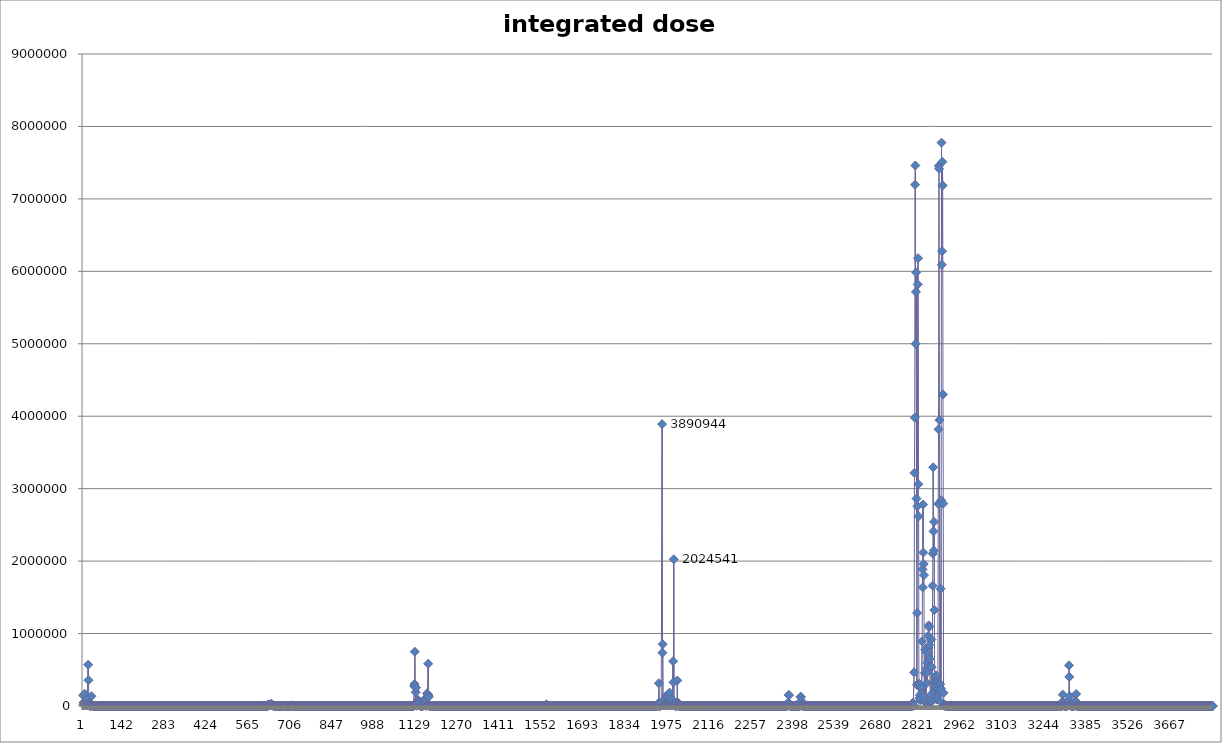
| Category | integrated dose (mGy) |
|---|---|
| 0 | 146913.26 |
| 1 | 47168.431 |
| 2 | 16474.147 |
| 3 | 19973.04 |
| 4 | 52875.603 |
| 5 | 169686.074 |
| 6 | 42847.178 |
| 7 | 30205.269 |
| 8 | 17112.355 |
| 9 | 18833.48 |
| 10 | 17870.895 |
| 11 | 18359.048 |
| 12 | 17347.151 |
| 13 | 97437.491 |
| 14 | 12307.267 |
| 15 | 10980.042 |
| 16 | 15013.119 |
| 17 | 569934.394 |
| 18 | 355591.583 |
| 19 | 43135.492 |
| 20 | 44348.157 |
| 21 | 28792.925 |
| 22 | 1795.39 |
| 23 | 7134.684 |
| 24 | 1881.535 |
| 25 | 2678.828 |
| 26 | 1564.105 |
| 27 | 9494.582 |
| 28 | 135804.302 |
| 29 | 14220.9 |
| 30 | 18117.512 |
| 31 | 2346.066 |
| 32 | 1790.662 |
| 33 | 1537.437 |
| 34 | 3353.156 |
| 35 | 1175.286 |
| 36 | 2075.394 |
| 37 | 353.776 |
| 38 | 478.748 |
| 39 | 322.157 |
| 40 | 958.439 |
| 41 | 440.392 |
| 42 | 363.976 |
| 43 | 236.195 |
| 44 | 506.674 |
| 45 | 155.876 |
| 46 | 200.646 |
| 47 | 127.648 |
| 48 | 260.69 |
| 49 | 205.865 |
| 50 | 234.515 |
| 51 | 308.53 |
| 52 | 208.58 |
| 53 | 221.372 |
| 54 | 239.774 |
| 55 | 133.824 |
| 56 | 539.037 |
| 57 | 145.965 |
| 58 | 263.314 |
| 59 | 143.309 |
| 60 | 238.723 |
| 61 | 327.87 |
| 62 | 4196.176 |
| 63 | 380.298 |
| 64 | 1165.318 |
| 65 | 173.021 |
| 66 | 388.234 |
| 67 | 168.84 |
| 68 | 179.166 |
| 69 | 80.651 |
| 70 | 142.878 |
| 71 | 107.209 |
| 72 | 135.183 |
| 73 | 175.527 |
| 74 | 82.107 |
| 75 | 84.558 |
| 76 | 138.68 |
| 77 | 165.458 |
| 78 | 871.94 |
| 79 | 1189.962 |
| 80 | 1108.671 |
| 81 | 1283.256 |
| 82 | 2549.128 |
| 83 | 1574.25 |
| 84 | 3073.741 |
| 85 | 2634.265 |
| 86 | 471.512 |
| 87 | 983.38 |
| 88 | 534.577 |
| 89 | 222.272 |
| 90 | 406.166 |
| 91 | 101.11 |
| 92 | 133.559 |
| 93 | 104.992 |
| 94 | 139.493 |
| 95 | 112.292 |
| 96 | 115.567 |
| 97 | 110.939 |
| 98 | 160.088 |
| 99 | 121.699 |
| 100 | 223.087 |
| 101 | 123.056 |
| 102 | 136.251 |
| 103 | 143.438 |
| 104 | 109.413 |
| 105 | 75.959 |
| 106 | 115.371 |
| 107 | 112.439 |
| 108 | 100.381 |
| 109 | 150.574 |
| 110 | 124.471 |
| 111 | 120.084 |
| 112 | 145.872 |
| 113 | 138.666 |
| 114 | 118.229 |
| 115 | 59.514 |
| 116 | 140.295 |
| 117 | 118.128 |
| 118 | 101.698 |
| 119 | 112.302 |
| 120 | 103.639 |
| 121 | 102.604 |
| 122 | 88.791 |
| 123 | 112.662 |
| 124 | 117.782 |
| 125 | 160.199 |
| 126 | 100.605 |
| 127 | 89.321 |
| 128 | 160.143 |
| 129 | 159.998 |
| 130 | 145.849 |
| 131 | 143.346 |
| 132 | 76.221 |
| 133 | 105.544 |
| 134 | 107.265 |
| 135 | 103.504 |
| 136 | 82.973 |
| 137 | 90.004 |
| 138 | 129.115 |
| 139 | 133.452 |
| 140 | 92.039 |
| 141 | 130.34 |
| 142 | 89.072 |
| 143 | 96.466 |
| 144 | 98.555 |
| 145 | 134.952 |
| 146 | 125.811 |
| 147 | 113.897 |
| 148 | 137.633 |
| 149 | 95.167 |
| 150 | 139.3 |
| 151 | 62.251 |
| 152 | 155.574 |
| 153 | 141.674 |
| 154 | 134.713 |
| 155 | 67.525 |
| 156 | 132.56 |
| 157 | 142.817 |
| 158 | 81.951 |
| 159 | 85.234 |
| 160 | 127.6 |
| 161 | 148.004 |
| 162 | 165.537 |
| 163 | 168.222 |
| 164 | 137.644 |
| 165 | 93.606 |
| 166 | 128.58 |
| 167 | 77.428 |
| 168 | 143.335 |
| 169 | 149.246 |
| 170 | 65.368 |
| 171 | 138.966 |
| 172 | 106.212 |
| 173 | 128.62 |
| 174 | 95.247 |
| 175 | 111.777 |
| 176 | 79.179 |
| 177 | 149.757 |
| 178 | 129.431 |
| 179 | 116.01 |
| 180 | 113.458 |
| 181 | 91.842 |
| 182 | 54.996 |
| 183 | 106.175 |
| 184 | 102.723 |
| 185 | 123.551 |
| 186 | 132.675 |
| 187 | 115.482 |
| 188 | 118.488 |
| 189 | 156.964 |
| 190 | 90.107 |
| 191 | 104.69 |
| 192 | 89.968 |
| 193 | 106.324 |
| 194 | 120.274 |
| 195 | 77.025 |
| 196 | 163.706 |
| 197 | 88.13 |
| 198 | 86.082 |
| 199 | 174.275 |
| 200 | 112.549 |
| 201 | 160.455 |
| 202 | 104.278 |
| 203 | 127.108 |
| 204 | 130.939 |
| 205 | 90.383 |
| 206 | 85.223 |
| 207 | 133.005 |
| 208 | 136.102 |
| 209 | 105.733 |
| 210 | 132.096 |
| 211 | 141.842 |
| 212 | 157.438 |
| 213 | 125.566 |
| 214 | 157.466 |
| 215 | 115.36 |
| 216 | 137.221 |
| 217 | 132.189 |
| 218 | 90.765 |
| 219 | 89.423 |
| 220 | 71.746 |
| 221 | 171.17 |
| 222 | 82.844 |
| 223 | 140.551 |
| 224 | 74.773 |
| 225 | 72.735 |
| 226 | 137.62 |
| 227 | 136.028 |
| 228 | 152.172 |
| 229 | 133.041 |
| 230 | 135.709 |
| 231 | 151.791 |
| 232 | 124.335 |
| 233 | 121.189 |
| 234 | 157.244 |
| 235 | 117.234 |
| 236 | 146.467 |
| 237 | 117.725 |
| 238 | 113.981 |
| 239 | 175.276 |
| 240 | 109.582 |
| 241 | 142.746 |
| 242 | 104.616 |
| 243 | 102.09 |
| 244 | 156.002 |
| 245 | 95.481 |
| 246 | 163.291 |
| 247 | 90.033 |
| 248 | 175.285 |
| 249 | 129.774 |
| 250 | 87.259 |
| 251 | 128.766 |
| 252 | 167.907 |
| 253 | 151.416 |
| 254 | 192.911 |
| 255 | 94.343 |
| 256 | 125.956 |
| 257 | 52.863 |
| 258 | 52.863 |
| 259 | 114.647 |
| 260 | 114.647 |
| 261 | 99.59 |
| 262 | 99.59 |
| 263 | 131.882 |
| 264 | 131.882 |
| 265 | 155.531 |
| 266 | 155.531 |
| 267 | 111.823 |
| 268 | 111.823 |
| 269 | 139.927 |
| 270 | 139.927 |
| 271 | 57.175 |
| 272 | 57.175 |
| 273 | 127.089 |
| 274 | 127.089 |
| 275 | 107.379 |
| 276 | 107.379 |
| 277 | 139.126 |
| 278 | 139.126 |
| 279 | 127.003 |
| 280 | 127.003 |
| 281 | 136.719 |
| 282 | 136.719 |
| 283 | 112.154 |
| 284 | 112.154 |
| 285 | 122.704 |
| 286 | 122.704 |
| 287 | 140.187 |
| 288 | 140.187 |
| 289 | 120.514 |
| 290 | 120.514 |
| 291 | 151.911 |
| 292 | 151.911 |
| 293 | 122.878 |
| 294 | 122.878 |
| 295 | 121.798 |
| 296 | 121.798 |
| 297 | 114.103 |
| 298 | 114.103 |
| 299 | 121.284 |
| 300 | 121.284 |
| 301 | 244.775 |
| 302 | 244.775 |
| 303 | 132.859 |
| 304 | 132.859 |
| 305 | 99.68 |
| 306 | 99.68 |
| 307 | 84.02 |
| 308 | 84.02 |
| 309 | 129.348 |
| 310 | 129.348 |
| 311 | 87.442 |
| 312 | 87.442 |
| 313 | 114.822 |
| 314 | 114.822 |
| 315 | 129.076 |
| 316 | 129.076 |
| 317 | 164.845 |
| 318 | 164.845 |
| 319 | 95.185 |
| 320 | 95.185 |
| 321 | 142 |
| 322 | 142 |
| 323 | 131.051 |
| 324 | 131.051 |
| 325 | 129.196 |
| 326 | 129.196 |
| 327 | 100.175 |
| 328 | 100.175 |
| 329 | 104.688 |
| 330 | 104.688 |
| 331 | 124.876 |
| 332 | 124.876 |
| 333 | 172.5 |
| 334 | 172.5 |
| 335 | 143.945 |
| 336 | 143.945 |
| 337 | 124.607 |
| 338 | 124.607 |
| 339 | 198.001 |
| 340 | 198.001 |
| 341 | 57.319 |
| 342 | 57.319 |
| 343 | 133.638 |
| 344 | 133.638 |
| 345 | 91.382 |
| 346 | 91.382 |
| 347 | 67.83 |
| 348 | 67.83 |
| 349 | 109.701 |
| 350 | 109.701 |
| 351 | 103.685 |
| 352 | 103.685 |
| 353 | 107.795 |
| 354 | 107.795 |
| 355 | 132.546 |
| 356 | 132.546 |
| 357 | 154.169 |
| 358 | 154.169 |
| 359 | 112.531 |
| 360 | 112.531 |
| 361 | 144.787 |
| 362 | 144.787 |
| 363 | 130.629 |
| 364 | 130.629 |
| 365 | 175.527 |
| 366 | 175.527 |
| 367 | 112.61 |
| 368 | 112.61 |
| 369 | 95.119 |
| 370 | 95.119 |
| 371 | 104.549 |
| 372 | 104.549 |
| 373 | 151.939 |
| 374 | 151.939 |
| 375 | 129.534 |
| 376 | 129.534 |
| 377 | 102.852 |
| 378 | 102.852 |
| 379 | 141.651 |
| 380 | 141.651 |
| 381 | 161.795 |
| 382 | 161.795 |
| 383 | 121.04 |
| 384 | 121.04 |
| 385 | 108.858 |
| 386 | 108.858 |
| 387 | 93.509 |
| 388 | 93.509 |
| 389 | 107.132 |
| 390 | 107.132 |
| 391 | 59.597 |
| 392 | 59.597 |
| 393 | 114.63 |
| 394 | 114.63 |
| 395 | 110.449 |
| 396 | 110.449 |
| 397 | 164.253 |
| 398 | 164.253 |
| 399 | 165.895 |
| 400 | 165.895 |
| 401 | 100.608 |
| 402 | 100.608 |
| 403 | 99.324 |
| 404 | 99.324 |
| 405 | 53.515 |
| 406 | 53.515 |
| 407 | 126.718 |
| 408 | 126.718 |
| 409 | 49.027 |
| 410 | 49.027 |
| 411 | 177.093 |
| 412 | 177.093 |
| 413 | 69.035 |
| 414 | 69.035 |
| 415 | 28.201 |
| 416 | 28.201 |
| 417 | 87.403 |
| 418 | 87.403 |
| 419 | 163.946 |
| 420 | 163.946 |
| 421 | 140.605 |
| 422 | 140.605 |
| 423 | 160.068 |
| 424 | 160.068 |
| 425 | 130.483 |
| 426 | 130.483 |
| 427 | 87.697 |
| 428 | 87.697 |
| 429 | 108.58 |
| 430 | 108.58 |
| 431 | 148.762 |
| 432 | 148.762 |
| 433 | 92.138 |
| 434 | 92.138 |
| 435 | 106.932 |
| 436 | 106.932 |
| 437 | 116.862 |
| 438 | 116.862 |
| 439 | 68.445 |
| 440 | 68.445 |
| 441 | 221.434 |
| 442 | 221.434 |
| 443 | 112.599 |
| 444 | 112.599 |
| 445 | 115.414 |
| 446 | 115.414 |
| 447 | 118.215 |
| 448 | 118.215 |
| 449 | 86.873 |
| 450 | 86.873 |
| 451 | 122.942 |
| 452 | 122.942 |
| 453 | 126.66 |
| 454 | 126.66 |
| 455 | 137.809 |
| 456 | 137.809 |
| 457 | 91.777 |
| 458 | 91.777 |
| 459 | 120.483 |
| 460 | 120.483 |
| 461 | 122.098 |
| 462 | 122.098 |
| 463 | 102.294 |
| 464 | 102.294 |
| 465 | 192.735 |
| 466 | 192.735 |
| 467 | 97.869 |
| 468 | 97.869 |
| 469 | 76.913 |
| 470 | 76.913 |
| 471 | 57.235 |
| 472 | 57.235 |
| 473 | 96.167 |
| 474 | 96.167 |
| 475 | 109.267 |
| 476 | 109.267 |
| 477 | 100.14 |
| 478 | 100.14 |
| 479 | 99.529 |
| 480 | 99.529 |
| 481 | 76.238 |
| 482 | 76.238 |
| 483 | 135.529 |
| 484 | 135.529 |
| 485 | 136.764 |
| 486 | 136.764 |
| 487 | 148.337 |
| 488 | 148.337 |
| 489 | 100.984 |
| 490 | 100.984 |
| 491 | 139.487 |
| 492 | 139.487 |
| 493 | 174.677 |
| 494 | 174.677 |
| 495 | 128.858 |
| 496 | 128.858 |
| 497 | 127.442 |
| 498 | 127.442 |
| 499 | 149.845 |
| 500 | 149.845 |
| 501 | 107.965 |
| 502 | 107.965 |
| 503 | 118.1 |
| 504 | 118.1 |
| 505 | 132.453 |
| 506 | 132.453 |
| 507 | 110.125 |
| 508 | 110.125 |
| 509 | 144.225 |
| 510 | 144.225 |
| 511 | 148.697 |
| 512 | 148.697 |
| 513 | 99.539 |
| 514 | 99.539 |
| 515 | 118.861 |
| 516 | 118.861 |
| 517 | 132.646 |
| 518 | 132.646 |
| 519 | 75.54 |
| 520 | 75.54 |
| 521 | 182.233 |
| 522 | 182.233 |
| 523 | 173.716 |
| 524 | 173.716 |
| 525 | 176.606 |
| 526 | 176.606 |
| 527 | 153.611 |
| 528 | 153.611 |
| 529 | 133.653 |
| 530 | 133.653 |
| 531 | 121.629 |
| 532 | 121.629 |
| 533 | 196.184 |
| 534 | 196.184 |
| 535 | 87.562 |
| 536 | 87.562 |
| 537 | 123.394 |
| 538 | 123.394 |
| 539 | 367.55 |
| 540 | 367.55 |
| 541 | 171.26 |
| 542 | 171.26 |
| 543 | 448.524 |
| 544 | 448.524 |
| 545 | 577.852 |
| 546 | 577.852 |
| 547 | 133.31 |
| 548 | 133.31 |
| 549 | 118.593 |
| 550 | 118.593 |
| 551 | 133.568 |
| 552 | 133.568 |
| 553 | 117.802 |
| 554 | 117.802 |
| 555 | 129.78 |
| 556 | 129.78 |
| 557 | 132.092 |
| 558 | 132.092 |
| 559 | 175.65 |
| 560 | 175.65 |
| 561 | 208.022 |
| 562 | 208.022 |
| 563 | 248.206 |
| 564 | 248.206 |
| 565 | 309.019 |
| 566 | 309.019 |
| 567 | 393.371 |
| 568 | 393.371 |
| 569 | 368.372 |
| 570 | 368.372 |
| 571 | 248.485 |
| 572 | 248.485 |
| 573 | 286.806 |
| 574 | 286.806 |
| 575 | 221.188 |
| 576 | 221.188 |
| 577 | 411.468 |
| 578 | 411.468 |
| 579 | 469.027 |
| 580 | 469.027 |
| 581 | 273.05 |
| 582 | 273.05 |
| 583 | 7670.433 |
| 584 | 7670.433 |
| 585 | 173.408 |
| 586 | 173.408 |
| 587 | 211.375 |
| 588 | 211.375 |
| 589 | 147.084 |
| 590 | 147.084 |
| 591 | 238.251 |
| 592 | 238.251 |
| 593 | 355.901 |
| 594 | 355.901 |
| 595 | 2580.383 |
| 596 | 2580.383 |
| 597 | 181.208 |
| 598 | 181.208 |
| 599 | 394.346 |
| 600 | 394.346 |
| 601 | 222.172 |
| 602 | 222.172 |
| 603 | 811.136 |
| 604 | 811.136 |
| 605 | 651.995 |
| 606 | 651.995 |
| 607 | 884.732 |
| 608 | 884.732 |
| 609 | 1206.5 |
| 610 | 1206.5 |
| 611 | 2763.998 |
| 612 | 2763.998 |
| 613 | 269.223 |
| 614 | 269.223 |
| 615 | 1053.465 |
| 616 | 1053.465 |
| 617 | 316.16 |
| 618 | 316.16 |
| 619 | 2846.88 |
| 620 | 2846.88 |
| 621 | 334.064 |
| 622 | 334.064 |
| 623 | 21355.488 |
| 624 | 21355.488 |
| 625 | 8970.66 |
| 626 | 8970.66 |
| 627 | 12553.194 |
| 628 | 12553.194 |
| 629 | 13147.029 |
| 630 | 13147.029 |
| 631 | 17308.216 |
| 632 | 17308.216 |
| 633 | 29379.257 |
| 634 | 29379.257 |
| 635 | 8188.929 |
| 636 | 8188.929 |
| 637 | 9082.197 |
| 638 | 9082.197 |
| 639 | 3253.518 |
| 640 | 3253.518 |
| 641 | 3323.17 |
| 642 | 3323.17 |
| 643 | 3783.786 |
| 644 | 3783.786 |
| 645 | 659.03 |
| 646 | 659.03 |
| 647 | 528.362 |
| 648 | 528.362 |
| 649 | 580.874 |
| 650 | 580.874 |
| 651 | 1893.122 |
| 652 | 1893.122 |
| 653 | 829.578 |
| 654 | 829.578 |
| 655 | 493.113 |
| 656 | 493.113 |
| 657 | 312.972 |
| 658 | 312.972 |
| 659 | 366.951 |
| 660 | 366.951 |
| 661 | 299.892 |
| 662 | 299.892 |
| 663 | 356.974 |
| 664 | 356.974 |
| 665 | 659.576 |
| 666 | 659.576 |
| 667 | 925.612 |
| 668 | 925.612 |
| 669 | 209.99 |
| 670 | 209.99 |
| 671 | 185.138 |
| 672 | 185.138 |
| 673 | 392.944 |
| 674 | 392.944 |
| 675 | 592.74 |
| 676 | 592.74 |
| 677 | 5692.542 |
| 678 | 5692.542 |
| 679 | 6641.785 |
| 680 | 6641.785 |
| 681 | 960.807 |
| 682 | 785.2 |
| 683 | 241.856 |
| 684 | 170.46 |
| 685 | 244.863 |
| 686 | 323.096 |
| 687 | 155.903 |
| 688 | 192.701 |
| 689 | 156.079 |
| 690 | 123.614 |
| 691 | 85.94 |
| 692 | 180.753 |
| 693 | 186.166 |
| 694 | 139.016 |
| 695 | 192.764 |
| 696 | 185.989 |
| 697 | 328.664 |
| 698 | 387.891 |
| 699 | 396.286 |
| 700 | 1477.383 |
| 701 | 3372.266 |
| 702 | 5618.839 |
| 703 | 9304.747 |
| 704 | 4284.831 |
| 705 | 4295.735 |
| 706 | 374.539 |
| 707 | 147.254 |
| 708 | 410.029 |
| 709 | 215.386 |
| 710 | 51.257 |
| 711 | 187.255 |
| 712 | 283.104 |
| 713 | 248.829 |
| 714 | 407.657 |
| 715 | 215.875 |
| 716 | 93.735 |
| 717 | 173.219 |
| 718 | 175.961 |
| 719 | 611.004 |
| 720 | 414.367 |
| 721 | 244.114 |
| 722 | 157.942 |
| 723 | 150.316 |
| 724 | 165.908 |
| 725 | 149.653 |
| 726 | 140.94 |
| 727 | 200.015 |
| 728 | 103.598 |
| 729 | 95.875 |
| 730 | 157.697 |
| 731 | 86.475 |
| 732 | 115.584 |
| 733 | 118.687 |
| 734 | 109.99 |
| 735 | 131.633 |
| 736 | 113.12 |
| 737 | 138.151 |
| 738 | 145.849 |
| 739 | 148.109 |
| 740 | 108.891 |
| 741 | 171.357 |
| 742 | 92.545 |
| 743 | 162.732 |
| 744 | 133.366 |
| 745 | 233.85 |
| 746 | 116.682 |
| 747 | 194.259 |
| 748 | 115.711 |
| 749 | 198.945 |
| 750 | 134.244 |
| 751 | 66.543 |
| 752 | 212.775 |
| 753 | 80.094 |
| 754 | 167.717 |
| 755 | 182.815 |
| 756 | 126.836 |
| 757 | 334.071 |
| 758 | 170.879 |
| 759 | 435.362 |
| 760 | 170.843 |
| 761 | 236.541 |
| 762 | 111.386 |
| 763 | 138.027 |
| 764 | 151.352 |
| 765 | 172.913 |
| 766 | 108.277 |
| 767 | 80.111 |
| 768 | 148.894 |
| 769 | 82.98 |
| 770 | 99.458 |
| 771 | 67.384 |
| 772 | 113.762 |
| 773 | 128.97 |
| 774 | 78.021 |
| 775 | 122.534 |
| 776 | 127.726 |
| 777 | 120.557 |
| 778 | 130.123 |
| 779 | 128.979 |
| 780 | 94.538 |
| 781 | 106.689 |
| 782 | 134.813 |
| 783 | 125.197 |
| 784 | 174.249 |
| 785 | 115.191 |
| 786 | 187.453 |
| 787 | 111.159 |
| 788 | 118.173 |
| 789 | 174.789 |
| 790 | 139.078 |
| 791 | 154.366 |
| 792 | 95.241 |
| 793 | 164.61 |
| 794 | 106.926 |
| 795 | 124.063 |
| 796 | 139.862 |
| 797 | 142.941 |
| 798 | 136.412 |
| 799 | 144.394 |
| 800 | 128.433 |
| 801 | 88.06 |
| 802 | 159.92 |
| 803 | 95.139 |
| 804 | 158.361 |
| 805 | 167.391 |
| 806 | 98.076 |
| 807 | 130.153 |
| 808 | 102.356 |
| 809 | 140.94 |
| 810 | 130.478 |
| 811 | 96.229 |
| 812 | 101.735 |
| 813 | 83.104 |
| 814 | 86.326 |
| 815 | 95.482 |
| 816 | 145.422 |
| 817 | 177.698 |
| 818 | 104.023 |
| 819 | 118.6 |
| 820 | 101.9 |
| 821 | 128.696 |
| 822 | 141.852 |
| 823 | 148.949 |
| 824 | 123.203 |
| 825 | 149.146 |
| 826 | 154.103 |
| 827 | 120.459 |
| 828 | 124.825 |
| 829 | 91.453 |
| 830 | 95.87 |
| 831 | 91.963 |
| 832 | 152.223 |
| 833 | 158.274 |
| 834 | 139.196 |
| 835 | 124.013 |
| 836 | 98.93 |
| 837 | 144.31 |
| 838 | 115.875 |
| 839 | 132.963 |
| 840 | 95.072 |
| 841 | 100.681 |
| 842 | 81.425 |
| 843 | 114.61 |
| 844 | 107.89 |
| 845 | 122.033 |
| 846 | 112.484 |
| 847 | 121.262 |
| 848 | 113.16 |
| 849 | 135.002 |
| 850 | 172.824 |
| 851 | 132.969 |
| 852 | 130.674 |
| 853 | 129.342 |
| 854 | 126.771 |
| 855 | 161.887 |
| 856 | 117.448 |
| 857 | 141.853 |
| 858 | 165.205 |
| 859 | 142.853 |
| 860 | 141.58 |
| 861 | 118.91 |
| 862 | 157.513 |
| 863 | 126.713 |
| 864 | 106.211 |
| 865 | 101.074 |
| 866 | 158.045 |
| 867 | 137.009 |
| 868 | 123.5 |
| 869 | 76.506 |
| 870 | 301.693 |
| 871 | 160.939 |
| 872 | 119.379 |
| 873 | 104.774 |
| 874 | 152.183 |
| 875 | 144.989 |
| 876 | 135.295 |
| 877 | 100.387 |
| 878 | 134.824 |
| 879 | 128.47 |
| 880 | 136.071 |
| 881 | 172.284 |
| 882 | 123.234 |
| 883 | 140.133 |
| 884 | 135.569 |
| 885 | 96.573 |
| 886 | 139.878 |
| 887 | 77.558 |
| 888 | 98.772 |
| 889 | 95.033 |
| 890 | 97.842 |
| 891 | 56.038 |
| 892 | 160.536 |
| 893 | 95.419 |
| 894 | 129.396 |
| 895 | 132.822 |
| 896 | 94.46 |
| 897 | 86.682 |
| 898 | 78.409 |
| 899 | 98.785 |
| 900 | 104.562 |
| 901 | 84.302 |
| 902 | 70.445 |
| 903 | 145.012 |
| 904 | 156.999 |
| 905 | 84.208 |
| 906 | 138.672 |
| 907 | 122.244 |
| 908 | 128.821 |
| 909 | 100.465 |
| 910 | 96.529 |
| 911 | 144.006 |
| 912 | 105.17 |
| 913 | 110.92 |
| 914 | 115.135 |
| 915 | 128.682 |
| 916 | 167.56 |
| 917 | 114.34 |
| 918 | 120.67 |
| 919 | 87.745 |
| 920 | 116.956 |
| 921 | 132.193 |
| 922 | 117.173 |
| 923 | 132.156 |
| 924 | 150.621 |
| 925 | 135.367 |
| 926 | 124.275 |
| 927 | 106.707 |
| 928 | 117.92 |
| 929 | 141.327 |
| 930 | 138.729 |
| 931 | 143.271 |
| 932 | 167.777 |
| 933 | 188.91 |
| 934 | 210.838 |
| 935 | 139.221 |
| 936 | 223.198 |
| 937 | 156.444 |
| 938 | 224.838 |
| 939 | 110.899 |
| 940 | 126.401 |
| 941 | 139.501 |
| 942 | 131.121 |
| 943 | 121.871 |
| 944 | 123.371 |
| 945 | 117.4 |
| 946 | 131.087 |
| 947 | 111.512 |
| 948 | 111.278 |
| 949 | 80.958 |
| 950 | 97.892 |
| 951 | 121.713 |
| 952 | 124.603 |
| 953 | 117.703 |
| 954 | 139.794 |
| 955 | 122.24 |
| 956 | 113.271 |
| 957 | 104.857 |
| 958 | 114.105 |
| 959 | 87.165 |
| 960 | 131.142 |
| 961 | 125.473 |
| 962 | 117.607 |
| 963 | 121.173 |
| 964 | 130.07 |
| 965 | 101.768 |
| 966 | 132.521 |
| 967 | 107.181 |
| 968 | 133.847 |
| 969 | 112.912 |
| 970 | 97.152 |
| 971 | 93.145 |
| 972 | 119.317 |
| 973 | 110.387 |
| 974 | 113.315 |
| 975 | 126.659 |
| 976 | 123.162 |
| 977 | 110.774 |
| 978 | 153.369 |
| 979 | 137.216 |
| 980 | 107.75 |
| 981 | 102.121 |
| 982 | 124.451 |
| 983 | 127.14 |
| 984 | 72.362 |
| 985 | 122.991 |
| 986 | 97.978 |
| 987 | 132.181 |
| 988 | 162.04 |
| 989 | 119.284 |
| 990 | 115.263 |
| 991 | 136.825 |
| 992 | 118.803 |
| 993 | 59.328 |
| 994 | 124.067 |
| 995 | 135.671 |
| 996 | 124.963 |
| 997 | 136.18 |
| 998 | 127.08 |
| 999 | 119.643 |
| 1000 | 150.819 |
| 1001 | 108.17 |
| 1002 | 100.937 |
| 1003 | 171.267 |
| 1004 | 110.913 |
| 1005 | 124.62 |
| 1006 | 158.7 |
| 1007 | 131.173 |
| 1008 | 123.576 |
| 1009 | 128.784 |
| 1010 | 128.476 |
| 1011 | 104.589 |
| 1012 | 135.365 |
| 1013 | 109.493 |
| 1014 | 146.782 |
| 1015 | 154.521 |
| 1016 | 120.056 |
| 1017 | 120.504 |
| 1018 | 132.058 |
| 1019 | 119.391 |
| 1020 | 158.143 |
| 1021 | 123.529 |
| 1022 | 129.819 |
| 1023 | 116.026 |
| 1024 | 114.008 |
| 1025 | 126.484 |
| 1026 | 106.419 |
| 1027 | 145.797 |
| 1028 | 115.321 |
| 1029 | 120.224 |
| 1030 | 102.556 |
| 1031 | 88.501 |
| 1032 | 135.853 |
| 1033 | 129.091 |
| 1034 | 132.477 |
| 1035 | 102.616 |
| 1036 | 119.87 |
| 1037 | 104.639 |
| 1038 | 106.978 |
| 1039 | 101.175 |
| 1040 | 92.765 |
| 1041 | 216.622 |
| 1042 | 212.696 |
| 1043 | 213.484 |
| 1044 | 174.972 |
| 1045 | 92.785 |
| 1046 | 115.939 |
| 1047 | 111.619 |
| 1048 | 111.755 |
| 1049 | 118.545 |
| 1050 | 100.151 |
| 1051 | 113.915 |
| 1052 | 130.313 |
| 1053 | 104.584 |
| 1054 | 118.065 |
| 1055 | 106.696 |
| 1056 | 120.901 |
| 1057 | 133.902 |
| 1058 | 220.831 |
| 1059 | 209.089 |
| 1060 | 170.257 |
| 1061 | 199.423 |
| 1062 | 177.023 |
| 1063 | 169.415 |
| 1064 | 190.902 |
| 1065 | 90.827 |
| 1066 | 88.963 |
| 1067 | 96.325 |
| 1068 | 74.769 |
| 1069 | 94.997 |
| 1070 | 149.951 |
| 1071 | 182.342 |
| 1072 | 175.695 |
| 1073 | 163.135 |
| 1074 | 220.447 |
| 1075 | 86.061 |
| 1076 | 90.359 |
| 1077 | 104.051 |
| 1078 | 132.527 |
| 1079 | 77.389 |
| 1080 | 199.289 |
| 1081 | 105.696 |
| 1082 | 145.722 |
| 1083 | 124.452 |
| 1084 | 99.981 |
| 1085 | 103.902 |
| 1086 | 127.662 |
| 1087 | 208.08 |
| 1088 | 128.848 |
| 1089 | 143.116 |
| 1090 | 159.505 |
| 1091 | 108.752 |
| 1092 | 124.057 |
| 1093 | 112.528 |
| 1094 | 135.253 |
| 1095 | 105.749 |
| 1096 | 113.738 |
| 1097 | 134.109 |
| 1098 | 152.024 |
| 1099 | 132.69 |
| 1100 | 224.187 |
| 1101 | 134.801 |
| 1102 | 412.138 |
| 1103 | 167.061 |
| 1104 | 1158.126 |
| 1105 | 1231.463 |
| 1106 | 3594.654 |
| 1107 | 222.713 |
| 1108 | 1053.892 |
| 1109 | 362.316 |
| 1110 | 449.16 |
| 1111 | 651.466 |
| 1112 | 956.448 |
| 1113 | 5385.564 |
| 1114 | 272921.163 |
| 1115 | 303084.042 |
| 1116 | 748900.411 |
| 1117 | 13333.627 |
| 1118 | 12987.496 |
| 1119 | 190024.149 |
| 1120 | 253486.825 |
| 1121 | 11973.955 |
| 1122 | 8915.734 |
| 1123 | 4826.461 |
| 1124 | 5369.556 |
| 1125 | 52816.591 |
| 1126 | 42907.696 |
| 1127 | 84542.557 |
| 1128 | 62972.924 |
| 1129 | 60958.905 |
| 1130 | 40607.783 |
| 1131 | 14664.128 |
| 1132 | 48360.89 |
| 1133 | 41092.992 |
| 1134 | 1784.757 |
| 1135 | 1821.149 |
| 1136 | 1137.861 |
| 1137 | 1365.443 |
| 1138 | 1200.288 |
| 1139 | 1065.293 |
| 1140 | 1190.809 |
| 1141 | 925.338 |
| 1142 | 1560.999 |
| 1143 | 1216.061 |
| 1144 | 38483.176 |
| 1145 | 59144.045 |
| 1146 | 10360.63 |
| 1147 | 47081.074 |
| 1148 | 65161.311 |
| 1149 | 73397.307 |
| 1150 | 96812.743 |
| 1151 | 38028.913 |
| 1152 | 33466.494 |
| 1153 | 3124.969 |
| 1154 | 3197.139 |
| 1155 | 5655.775 |
| 1156 | 6219.95 |
| 1157 | 175200.623 |
| 1158 | 128264.111 |
| 1159 | 7957.315 |
| 1160 | 6991.024 |
| 1161 | 583222.754 |
| 1162 | 151235.275 |
| 1163 | 126101.82 |
| 1164 | 4647.866 |
| 1165 | 1556.543 |
| 1166 | 489.59 |
| 1167 | 374.627 |
| 1168 | 351.291 |
| 1169 | 1083.386 |
| 1170 | 275.169 |
| 1171 | 5637.06 |
| 1172 | 1608.38 |
| 1173 | 757.152 |
| 1174 | 169.71 |
| 1175 | 203.032 |
| 1176 | 103.608 |
| 1177 | 197.454 |
| 1178 | 171.631 |
| 1179 | 205.903 |
| 1180 | 119.661 |
| 1181 | 149.508 |
| 1182 | 185.22 |
| 1183 | 211.29 |
| 1184 | 139.451 |
| 1185 | 846.04 |
| 1186 | 124.456 |
| 1187 | 495.306 |
| 1188 | 201.837 |
| 1189 | 550.297 |
| 1190 | 457.601 |
| 1191 | 180.014 |
| 1192 | 148.534 |
| 1193 | 172.366 |
| 1194 | 127.932 |
| 1195 | 169.598 |
| 1196 | 162.826 |
| 1197 | 275.163 |
| 1198 | 55.913 |
| 1199 | 281.558 |
| 1200 | 40.478 |
| 1201 | 127.897 |
| 1202 | 80.872 |
| 1203 | 251.138 |
| 1204 | 222.185 |
| 1205 | 170.517 |
| 1206 | 216.539 |
| 1207 | 201.365 |
| 1208 | 125.921 |
| 1209 | 123.363 |
| 1210 | 90.585 |
| 1211 | 169.059 |
| 1212 | 107.474 |
| 1213 | 332.122 |
| 1214 | 219.817 |
| 1215 | 231.62 |
| 1216 | 283.054 |
| 1217 | 205.963 |
| 1218 | 234.258 |
| 1219 | 157.878 |
| 1220 | 50.445 |
| 1221 | 167.824 |
| 1222 | 12.017 |
| 1223 | 85.909 |
| 1224 | 69.736 |
| 1225 | 81.323 |
| 1226 | 53.06 |
| 1227 | 111.556 |
| 1228 | 114.526 |
| 1229 | 100.817 |
| 1230 | 105.038 |
| 1231 | 110.225 |
| 1232 | 109.445 |
| 1233 | 218.139 |
| 1234 | 196.317 |
| 1235 | 237.238 |
| 1236 | 230.547 |
| 1237 | 115.048 |
| 1238 | 224.034 |
| 1239 | 117.86 |
| 1240 | 123.384 |
| 1241 | 106.635 |
| 1242 | 113.218 |
| 1243 | 131.793 |
| 1244 | 130.326 |
| 1245 | 127.41 |
| 1246 | 114.568 |
| 1247 | 136.961 |
| 1248 | 128.367 |
| 1249 | 126.586 |
| 1250 | 114.356 |
| 1251 | 126.374 |
| 1252 | 129.968 |
| 1253 | 133.133 |
| 1254 | 124.025 |
| 1255 | 135.35 |
| 1256 | 138.94 |
| 1257 | 134.892 |
| 1258 | 133.465 |
| 1259 | 138.274 |
| 1260 | 143.127 |
| 1261 | 125.382 |
| 1262 | 136.604 |
| 1263 | 148.713 |
| 1264 | 129.741 |
| 1265 | 112.969 |
| 1266 | 133.048 |
| 1267 | 116.8 |
| 1268 | 129.616 |
| 1269 | 126.087 |
| 1270 | 103.976 |
| 1271 | 119.163 |
| 1272 | 133.795 |
| 1273 | 113.696 |
| 1274 | 120.246 |
| 1275 | 129.104 |
| 1276 | 113.951 |
| 1277 | 112.523 |
| 1278 | 121.047 |
| 1279 | 117.899 |
| 1280 | 113.959 |
| 1281 | 123.112 |
| 1282 | 109.76 |
| 1283 | 127.824 |
| 1284 | 128.686 |
| 1285 | 126.578 |
| 1286 | 126.963 |
| 1287 | 130.89 |
| 1288 | 127.568 |
| 1289 | 124.592 |
| 1290 | 126.354 |
| 1291 | 114.301 |
| 1292 | 135.302 |
| 1293 | 125.035 |
| 1294 | 123.919 |
| 1295 | 121.695 |
| 1296 | 147.611 |
| 1297 | 122.455 |
| 1298 | 144.543 |
| 1299 | 128.199 |
| 1300 | 131.956 |
| 1301 | 124.456 |
| 1302 | 128.618 |
| 1303 | 150.893 |
| 1304 | 122.075 |
| 1305 | 119.412 |
| 1306 | 122.15 |
| 1307 | 118.377 |
| 1308 | 125.975 |
| 1309 | 125.563 |
| 1310 | 121.862 |
| 1311 | 127.057 |
| 1312 | 125.96 |
| 1313 | 116.232 |
| 1314 | 125.26 |
| 1315 | 131.731 |
| 1316 | 124.807 |
| 1317 | 124.373 |
| 1318 | 117.973 |
| 1319 | 121.885 |
| 1320 | 126.926 |
| 1321 | 130.413 |
| 1322 | 119.121 |
| 1323 | 121.864 |
| 1324 | 134.351 |
| 1325 | 127.809 |
| 1326 | 127.775 |
| 1327 | 126.894 |
| 1328 | 129.132 |
| 1329 | 128.658 |
| 1330 | 128.095 |
| 1331 | 129.805 |
| 1332 | 124.196 |
| 1333 | 122.534 |
| 1334 | 112.844 |
| 1335 | 122.374 |
| 1336 | 129.858 |
| 1337 | 125.436 |
| 1338 | 131.279 |
| 1339 | 127.228 |
| 1340 | 129.743 |
| 1341 | 126.449 |
| 1342 | 125.167 |
| 1343 | 126.265 |
| 1344 | 129.874 |
| 1345 | 122.636 |
| 1346 | 124.945 |
| 1347 | 123.17 |
| 1348 | 125.092 |
| 1349 | 122.214 |
| 1350 | 126.471 |
| 1351 | 115.988 |
| 1352 | 122.459 |
| 1353 | 128.115 |
| 1354 | 121.024 |
| 1355 | 131.394 |
| 1356 | 127.559 |
| 1357 | 122.445 |
| 1358 | 124.434 |
| 1359 | 132.023 |
| 1360 | 126.418 |
| 1361 | 120.225 |
| 1362 | 132.018 |
| 1363 | 134.254 |
| 1364 | 127.628 |
| 1365 | 119.923 |
| 1366 | 125.636 |
| 1367 | 126.502 |
| 1368 | 128.451 |
| 1369 | 125.967 |
| 1370 | 122.007 |
| 1371 | 126.381 |
| 1372 | 131.988 |
| 1373 | 111.688 |
| 1374 | 105.475 |
| 1375 | 120.077 |
| 1376 | 103.604 |
| 1377 | 117.111 |
| 1378 | 111.522 |
| 1379 | 106.966 |
| 1380 | 108.703 |
| 1381 | 114.525 |
| 1382 | 101.092 |
| 1383 | 107.385 |
| 1384 | 109.375 |
| 1385 | 116.037 |
| 1386 | 120.157 |
| 1387 | 122.089 |
| 1388 | 112.882 |
| 1389 | 110.44 |
| 1390 | 113.465 |
| 1391 | 116.809 |
| 1392 | 131.925 |
| 1393 | 115.207 |
| 1394 | 118.781 |
| 1395 | 110.756 |
| 1396 | 112.915 |
| 1397 | 107.942 |
| 1398 | 116.481 |
| 1399 | 113.921 |
| 1400 | 109.008 |
| 1401 | 117.266 |
| 1402 | 112.249 |
| 1403 | 105.833 |
| 1404 | 111.635 |
| 1405 | 119.446 |
| 1406 | 111.3 |
| 1407 | 115.238 |
| 1408 | 110.707 |
| 1409 | 101.841 |
| 1410 | 114.287 |
| 1411 | 130.271 |
| 1412 | 97.254 |
| 1413 | 115.443 |
| 1414 | 116.53 |
| 1415 | 102.996 |
| 1416 | 118.958 |
| 1417 | 110.366 |
| 1418 | 114.285 |
| 1419 | 111.647 |
| 1420 | 111.768 |
| 1421 | 110.909 |
| 1422 | 123.613 |
| 1423 | 119.632 |
| 1424 | 114.176 |
| 1425 | 116.695 |
| 1426 | 112.553 |
| 1427 | 116.481 |
| 1428 | 110.371 |
| 1429 | 108.871 |
| 1430 | 100.331 |
| 1431 | 110.092 |
| 1432 | 108.7 |
| 1433 | 115.583 |
| 1434 | 114.58 |
| 1435 | 110.179 |
| 1436 | 124.286 |
| 1437 | 112.388 |
| 1438 | 105.727 |
| 1439 | 130.555 |
| 1440 | 130.362 |
| 1441 | 103.068 |
| 1442 | 113.924 |
| 1443 | 113.548 |
| 1444 | 118.548 |
| 1445 | 110.927 |
| 1446 | 108.66 |
| 1447 | 97.915 |
| 1448 | 100.997 |
| 1449 | 117.179 |
| 1450 | 118.89 |
| 1451 | 114.748 |
| 1452 | 112.034 |
| 1453 | 105.819 |
| 1454 | 117.275 |
| 1455 | 107.668 |
| 1456 | 106.921 |
| 1457 | 119.765 |
| 1458 | 110.114 |
| 1459 | 112.758 |
| 1460 | 121.997 |
| 1461 | 113.396 |
| 1462 | 122.92 |
| 1463 | 117.17 |
| 1464 | 138.912 |
| 1465 | 97.416 |
| 1466 | 132.165 |
| 1467 | 114.075 |
| 1468 | 104.013 |
| 1469 | 97.657 |
| 1470 | 123.28 |
| 1471 | 128.358 |
| 1472 | 138.656 |
| 1473 | 117.194 |
| 1474 | 124.939 |
| 1475 | 106.876 |
| 1476 | 108.081 |
| 1477 | 104.057 |
| 1478 | 112.473 |
| 1479 | 116.058 |
| 1480 | 113.909 |
| 1481 | 116.09 |
| 1482 | 100.009 |
| 1483 | 102.181 |
| 1484 | 113.449 |
| 1485 | 100.564 |
| 1486 | 119.056 |
| 1487 | 125.201 |
| 1488 | 116.538 |
| 1489 | 106.666 |
| 1490 | 121.574 |
| 1491 | 119.043 |
| 1492 | 126.628 |
| 1493 | 104.927 |
| 1494 | 128.269 |
| 1495 | 92.604 |
| 1496 | 111.335 |
| 1497 | 117.477 |
| 1498 | 122.48 |
| 1499 | 99.614 |
| 1500 | 117.442 |
| 1501 | 130.684 |
| 1502 | 103.15 |
| 1503 | 100.427 |
| 1504 | 114.626 |
| 1505 | 126.668 |
| 1506 | 124.099 |
| 1507 | 98.355 |
| 1508 | 76.964 |
| 1509 | 99.074 |
| 1510 | 123.368 |
| 1511 | 76.952 |
| 1512 | 132.805 |
| 1513 | 130.406 |
| 1514 | 103.178 |
| 1515 | 94.994 |
| 1516 | 152.835 |
| 1517 | 127.222 |
| 1518 | 221.029 |
| 1519 | 131.128 |
| 1520 | 126.711 |
| 1521 | 87.872 |
| 1522 | 134.146 |
| 1523 | 81.857 |
| 1524 | 109.532 |
| 1525 | 121.388 |
| 1526 | 101.789 |
| 1527 | 123.036 |
| 1528 | 125.553 |
| 1529 | 112.397 |
| 1530 | 179.064 |
| 1531 | 133.748 |
| 1532 | 205.718 |
| 1533 | 123.274 |
| 1534 | 446.62 |
| 1535 | 353.604 |
| 1536 | 628.361 |
| 1537 | 239.425 |
| 1538 | 346.428 |
| 1539 | 184.533 |
| 1540 | 1323.63 |
| 1541 | 585.685 |
| 1542 | 1015.637 |
| 1543 | 646.007 |
| 1544 | 293.161 |
| 1545 | 307.411 |
| 1546 | 428.402 |
| 1547 | 288.793 |
| 1548 | 409.462 |
| 1549 | 1295.914 |
| 1550 | 1611.187 |
| 1551 | 4204.697 |
| 1552 | 351.155 |
| 1553 | 667.92 |
| 1554 | 312.132 |
| 1555 | 514.838 |
| 1556 | 568.999 |
| 1557 | 660.006 |
| 1558 | 362.388 |
| 1559 | 22807.863 |
| 1560 | 2021.038 |
| 1561 | 2307.484 |
| 1562 | 414.541 |
| 1563 | 184.962 |
| 1564 | 721.529 |
| 1565 | 232.153 |
| 1566 | 387.449 |
| 1567 | 299.739 |
| 1568 | 2244.637 |
| 1569 | 652.082 |
| 1570 | 1065.991 |
| 1571 | 246.592 |
| 1572 | 561.887 |
| 1573 | 243.146 |
| 1574 | 649.102 |
| 1575 | 217.144 |
| 1576 | 336.226 |
| 1577 | 149.387 |
| 1578 | 170.584 |
| 1579 | 127.919 |
| 1580 | 156.449 |
| 1581 | 102.052 |
| 1582 | 132.257 |
| 1583 | 144.336 |
| 1584 | 121.796 |
| 1585 | 102.547 |
| 1586 | 105.631 |
| 1587 | 100.511 |
| 1588 | 152.738 |
| 1589 | 169.572 |
| 1590 | 108.334 |
| 1591 | 101.629 |
| 1592 | 123.902 |
| 1593 | 105.82 |
| 1594 | 117.697 |
| 1595 | 115.564 |
| 1596 | 113.003 |
| 1597 | 74.546 |
| 1598 | 124.654 |
| 1599 | 91.106 |
| 1600 | 90.406 |
| 1601 | 168.525 |
| 1602 | 68.243 |
| 1603 | 114.042 |
| 1604 | 76.811 |
| 1605 | 108.715 |
| 1606 | 94.831 |
| 1607 | 174.682 |
| 1608 | 140.385 |
| 1609 | 108.461 |
| 1610 | 155.057 |
| 1611 | 103.306 |
| 1612 | 99.603 |
| 1613 | 93.403 |
| 1614 | 84.286 |
| 1615 | 100.413 |
| 1616 | 109.219 |
| 1617 | 92.15 |
| 1618 | 116.878 |
| 1619 | 126.544 |
| 1620 | 108.796 |
| 1621 | 123.363 |
| 1622 | 92.183 |
| 1623 | 101.286 |
| 1624 | 149.994 |
| 1625 | 148.041 |
| 1626 | 144.707 |
| 1627 | 135.394 |
| 1628 | 171.446 |
| 1629 | 128.845 |
| 1630 | 109.737 |
| 1631 | 127.15 |
| 1632 | 102.288 |
| 1633 | 105.158 |
| 1634 | 110.531 |
| 1635 | 98.68 |
| 1636 | 104.366 |
| 1637 | 88.504 |
| 1638 | 113.312 |
| 1639 | 94.86 |
| 1640 | 86.474 |
| 1641 | 137.924 |
| 1642 | 97.712 |
| 1643 | 89.547 |
| 1644 | 120.432 |
| 1645 | 100.627 |
| 1646 | 101.363 |
| 1647 | 106.787 |
| 1648 | 173.814 |
| 1649 | 107.466 |
| 1650 | 109.39 |
| 1651 | 122.471 |
| 1652 | 102.933 |
| 1653 | 117.332 |
| 1654 | 106.774 |
| 1655 | 90.74 |
| 1656 | 94.554 |
| 1657 | 145.331 |
| 1658 | 113.412 |
| 1659 | 114.679 |
| 1660 | 110.661 |
| 1661 | 117.478 |
| 1662 | 125.65 |
| 1663 | 131.224 |
| 1664 | 91.596 |
| 1665 | 105.911 |
| 1666 | 131.393 |
| 1667 | 82.237 |
| 1668 | 100.97 |
| 1669 | 133.483 |
| 1670 | 115.228 |
| 1671 | 132.064 |
| 1672 | 160.054 |
| 1673 | 181.752 |
| 1674 | 244.793 |
| 1675 | 160.587 |
| 1676 | 254.565 |
| 1677 | 119.16 |
| 1678 | 118.351 |
| 1679 | 129.238 |
| 1680 | 122.078 |
| 1681 | 120.002 |
| 1682 | 118.958 |
| 1683 | 126.809 |
| 1684 | 68.899 |
| 1685 | 120.203 |
| 1686 | 117.779 |
| 1687 | 87.157 |
| 1688 | 101.631 |
| 1689 | 89.417 |
| 1690 | 106.529 |
| 1691 | 175.687 |
| 1692 | 126.898 |
| 1693 | 127.641 |
| 1694 | 88.958 |
| 1695 | 126.679 |
| 1696 | 119.823 |
| 1697 | 100.586 |
| 1698 | 131.304 |
| 1699 | 104.677 |
| 1700 | 125.542 |
| 1701 | 93.978 |
| 1702 | 80.846 |
| 1703 | 100.084 |
| 1704 | 123.224 |
| 1705 | 174.065 |
| 1706 | 102.144 |
| 1707 | 119.211 |
| 1708 | 131.588 |
| 1709 | 107.028 |
| 1710 | 142.294 |
| 1711 | 122.273 |
| 1712 | 144.891 |
| 1713 | 114.535 |
| 1714 | 116.234 |
| 1715 | 127.633 |
| 1716 | 157.162 |
| 1717 | 113.421 |
| 1718 | 109.213 |
| 1719 | 123.855 |
| 1720 | 99.672 |
| 1721 | 129.929 |
| 1722 | 112.166 |
| 1723 | 94.03 |
| 1724 | 112.283 |
| 1725 | 101.528 |
| 1726 | 104.923 |
| 1727 | 120.059 |
| 1728 | 49.317 |
| 1729 | 190.173 |
| 1730 | 130.503 |
| 1731 | 156.479 |
| 1732 | 92.873 |
| 1733 | 116.046 |
| 1734 | 130.483 |
| 1735 | 133.268 |
| 1736 | 53.092 |
| 1737 | 111.283 |
| 1738 | 127.092 |
| 1739 | 123.964 |
| 1740 | 90.264 |
| 1741 | 128.542 |
| 1742 | 128.73 |
| 1743 | 110.561 |
| 1744 | 116.894 |
| 1745 | 105.35 |
| 1746 | 70.776 |
| 1747 | 95.489 |
| 1748 | 100.119 |
| 1749 | 119.082 |
| 1750 | 100.113 |
| 1751 | 102.043 |
| 1752 | 123.678 |
| 1753 | 118.066 |
| 1754 | 109.709 |
| 1755 | 85.354 |
| 1756 | 126.007 |
| 1757 | 155.583 |
| 1758 | 118.882 |
| 1759 | 115.754 |
| 1760 | 107.203 |
| 1761 | 93.86 |
| 1762 | 121.207 |
| 1763 | 80.331 |
| 1764 | 102.39 |
| 1765 | 112.758 |
| 1766 | 139.428 |
| 1767 | 132.999 |
| 1768 | 119.324 |
| 1769 | 108.865 |
| 1770 | 110.554 |
| 1771 | 111.941 |
| 1772 | 102.624 |
| 1773 | 116.184 |
| 1774 | 147.105 |
| 1775 | 154.255 |
| 1776 | 96.726 |
| 1777 | 77.601 |
| 1778 | 157.921 |
| 1779 | 122.877 |
| 1780 | 115.145 |
| 1781 | 131.308 |
| 1782 | 132.094 |
| 1783 | 123.605 |
| 1784 | 138.591 |
| 1785 | 145.965 |
| 1786 | 116.028 |
| 1787 | 112.916 |
| 1788 | 137.081 |
| 1789 | 116.902 |
| 1790 | 99.555 |
| 1791 | 114.143 |
| 1792 | 151.801 |
| 1793 | 101.345 |
| 1794 | 121.687 |
| 1795 | 129.88 |
| 1796 | 128.952 |
| 1797 | 120.254 |
| 1798 | 147.868 |
| 1799 | 103.882 |
| 1800 | 115.936 |
| 1801 | 160.657 |
| 1802 | 112.95 |
| 1803 | 126.827 |
| 1804 | 127.678 |
| 1805 | 111.311 |
| 1806 | 104.191 |
| 1807 | 111.151 |
| 1808 | 135.014 |
| 1809 | 127.659 |
| 1810 | 126.422 |
| 1811 | 124.524 |
| 1812 | 133.027 |
| 1813 | 120.401 |
| 1814 | 126.366 |
| 1815 | 110.73 |
| 1816 | 147.321 |
| 1817 | 126.817 |
| 1818 | 126.388 |
| 1819 | 132.528 |
| 1820 | 170.173 |
| 1821 | 114.715 |
| 1822 | 110.16 |
| 1823 | 92.692 |
| 1824 | 132.61 |
| 1825 | 104.641 |
| 1826 | 95.812 |
| 1827 | 84.107 |
| 1828 | 119.974 |
| 1829 | 102.884 |
| 1830 | 118.865 |
| 1831 | 153.363 |
| 1832 | 107.655 |
| 1833 | 114.565 |
| 1834 | 97.202 |
| 1835 | 103.651 |
| 1836 | 101.966 |
| 1837 | 124.815 |
| 1838 | 141.154 |
| 1839 | 98.907 |
| 1840 | 68.577 |
| 1841 | 130.979 |
| 1842 | 83.655 |
| 1843 | 139.198 |
| 1844 | 146.488 |
| 1845 | 107.98 |
| 1846 | 121.392 |
| 1847 | 90.656 |
| 1848 | 136.184 |
| 1849 | 133.692 |
| 1850 | 138.385 |
| 1851 | 120.543 |
| 1852 | 119.074 |
| 1853 | 127.617 |
| 1854 | 110.031 |
| 1855 | 120.889 |
| 1856 | 131.453 |
| 1857 | 133.81 |
| 1858 | 120.155 |
| 1859 | 120.034 |
| 1860 | 83.631 |
| 1861 | 142.643 |
| 1862 | 152.659 |
| 1863 | 123.478 |
| 1864 | 190.126 |
| 1865 | 121.303 |
| 1866 | 199.887 |
| 1867 | 130.851 |
| 1868 | 357.602 |
| 1869 | 166.147 |
| 1870 | 108.205 |
| 1871 | 217.51 |
| 1872 | 116.907 |
| 1873 | 112.355 |
| 1874 | 105.554 |
| 1875 | 118.623 |
| 1876 | 154.313 |
| 1877 | 143.107 |
| 1878 | 946.005 |
| 1879 | 275.906 |
| 1880 | 1065.758 |
| 1881 | 412.817 |
| 1882 | 2354.371 |
| 1883 | 1068.772 |
| 1884 | 3303.014 |
| 1885 | 2986.22 |
| 1886 | 2020.883 |
| 1887 | 426.943 |
| 1888 | 973.321 |
| 1889 | 1441.546 |
| 1890 | 1245.148 |
| 1891 | 128.217 |
| 1892 | 93.373 |
| 1893 | 120.044 |
| 1894 | 90.201 |
| 1895 | 113.407 |
| 1896 | 137.743 |
| 1897 | 186.089 |
| 1898 | 189.096 |
| 1899 | 515.879 |
| 1900 | 231.888 |
| 1901 | 1203.209 |
| 1902 | 337.818 |
| 1903 | 5544.691 |
| 1904 | 442.197 |
| 1905 | 709.571 |
| 1906 | 181.738 |
| 1907 | 375.37 |
| 1908 | 182.011 |
| 1909 | 777.319 |
| 1910 | 177.32 |
| 1911 | 494.999 |
| 1912 | 468.153 |
| 1913 | 360.11 |
| 1914 | 409.892 |
| 1915 | 225.578 |
| 1916 | 231.919 |
| 1917 | 394.426 |
| 1918 | 176.249 |
| 1919 | 282.023 |
| 1920 | 176.769 |
| 1921 | 911.136 |
| 1922 | 300.187 |
| 1923 | 3496.825 |
| 1924 | 342.668 |
| 1925 | 686.9 |
| 1926 | 406.707 |
| 1927 | 1600.868 |
| 1928 | 4672.992 |
| 1929 | 1416.598 |
| 1930 | 9832.4 |
| 1931 | 8020.051 |
| 1932 | 1467.972 |
| 1933 | 2237.356 |
| 1934 | 2721.81 |
| 1935 | 21776.556 |
| 1936 | 40596.36 |
| 1937 | 313995.211 |
| 1938 | 22539.388 |
| 1939 | 972.297 |
| 1940 | 1445.553 |
| 1941 | 1124.151 |
| 1942 | 3763.082 |
| 1943 | 1258.831 |
| 1944 | 14220.115 |
| 1945 | 43244.478 |
| 1946 | 32430.37 |
| 1947 | 46384.283 |
| 1948 | 3890943.93 |
| 1949 | 735966.442 |
| 1950 | 852377.153 |
| 1951 | 13268.214 |
| 1952 | 11712.051 |
| 1953 | 15216.029 |
| 1954 | 86600.496 |
| 1955 | 23785.257 |
| 1956 | 21127.069 |
| 1957 | 21210.147 |
| 1958 | 22583.177 |
| 1959 | 21053.749 |
| 1960 | 30141.421 |
| 1961 | 36396.326 |
| 1962 | 139229.284 |
| 1963 | 48572.395 |
| 1964 | 23393.315 |
| 1965 | 16114.371 |
| 1966 | 36527.964 |
| 1967 | 142313.078 |
| 1968 | 137323.574 |
| 1969 | 43867.872 |
| 1970 | 16239.024 |
| 1971 | 21417.777 |
| 1972 | 47791.124 |
| 1973 | 184836.243 |
| 1974 | 43133.92 |
| 1975 | 30085.36 |
| 1976 | 17013.183 |
| 1977 | 16789.821 |
| 1978 | 16361.45 |
| 1979 | 16566.557 |
| 1980 | 20718.278 |
| 1981 | 92999.204 |
| 1982 | 12129.71 |
| 1983 | 10381.19 |
| 1984 | 16150.893 |
| 1985 | 618142.301 |
| 1986 | 326584.473 |
| 1987 | 2024540.545 |
| 1988 | 23418.701 |
| 1989 | 22015.331 |
| 1990 | 25329.315 |
| 1991 | 18097.482 |
| 1992 | 1494.697 |
| 1993 | 1480.999 |
| 1994 | 5457.446 |
| 1995 | 1435.865 |
| 1996 | 2012.22 |
| 1997 | 1128.591 |
| 1998 | 24093.864 |
| 1999 | 352206.044 |
| 2000 | 52264.868 |
| 2001 | 26413.874 |
| 2002 | 4986.22 |
| 2003 | 4279.383 |
| 2004 | 1686.667 |
| 2005 | 2011.797 |
| 2006 | 10532.407 |
| 2007 | 1887.254 |
| 2008 | 4619.817 |
| 2009 | 685.067 |
| 2010 | 945.182 |
| 2011 | 377.886 |
| 2012 | 2449.589 |
| 2013 | 315.049 |
| 2014 | 1454.022 |
| 2015 | 189.847 |
| 2016 | 350.247 |
| 2017 | 129.866 |
| 2018 | 395.035 |
| 2019 | 328.952 |
| 2020 | 297.712 |
| 2021 | 532.445 |
| 2022 | 518.316 |
| 2023 | 542.86 |
| 2024 | 545.976 |
| 2025 | 197.275 |
| 2026 | 1299.113 |
| 2027 | 240.835 |
| 2028 | 492.813 |
| 2029 | 180.061 |
| 2030 | 633.04 |
| 2031 | 372.243 |
| 2032 | 4326.149 |
| 2033 | 507.092 |
| 2034 | 1669.11 |
| 2035 | 221.233 |
| 2036 | 448.383 |
| 2037 | 204.794 |
| 2038 | 182.732 |
| 2039 | 119.519 |
| 2040 | 107.483 |
| 2041 | 91.403 |
| 2042 | 121.686 |
| 2043 | 99.806 |
| 2044 | 89.779 |
| 2045 | 1019.765 |
| 2046 | 1692.286 |
| 2047 | 1758.911 |
| 2048 | 1449.175 |
| 2049 | 2428.393 |
| 2050 | 1909.176 |
| 2051 | 2643.239 |
| 2052 | 2641.377 |
| 2053 | 1443.769 |
| 2054 | 4389.293 |
| 2055 | 375.602 |
| 2056 | 1144.246 |
| 2057 | 576.035 |
| 2058 | 175.441 |
| 2059 | 398.115 |
| 2060 | 127.193 |
| 2061 | 156.111 |
| 2062 | 104.158 |
| 2063 | 102.869 |
| 2064 | 116.944 |
| 2065 | 101.205 |
| 2066 | 200.024 |
| 2067 | 195.681 |
| 2068 | 134.517 |
| 2069 | 390.156 |
| 2070 | 166.701 |
| 2071 | 418.711 |
| 2072 | 166.173 |
| 2073 | 209.69 |
| 2074 | 129.596 |
| 2075 | 101.112 |
| 2076 | 134.407 |
| 2077 | 114.218 |
| 2078 | 150.828 |
| 2079 | 122.532 |
| 2080 | 90.138 |
| 2081 | 83.819 |
| 2082 | 126.125 |
| 2083 | 146.577 |
| 2084 | 98.379 |
| 2085 | 133.315 |
| 2086 | 132.876 |
| 2087 | 101.33 |
| 2088 | 126.233 |
| 2089 | 130.824 |
| 2090 | 139.269 |
| 2091 | 154.393 |
| 2092 | 131.947 |
| 2093 | 137.436 |
| 2094 | 116.424 |
| 2095 | 108.583 |
| 2096 | 146.712 |
| 2097 | 127.169 |
| 2098 | 109.542 |
| 2099 | 99.146 |
| 2100 | 125.682 |
| 2101 | 122.966 |
| 2102 | 119.911 |
| 2103 | 87.717 |
| 2104 | 113.486 |
| 2105 | 130.789 |
| 2106 | 136.264 |
| 2107 | 89.039 |
| 2108 | 93.597 |
| 2109 | 147.761 |
| 2110 | 108.294 |
| 2111 | 96.437 |
| 2112 | 93.576 |
| 2113 | 107.279 |
| 2114 | 130.848 |
| 2115 | 122.176 |
| 2116 | 146.401 |
| 2117 | 92.295 |
| 2118 | 94.612 |
| 2119 | 114.972 |
| 2120 | 127.839 |
| 2121 | 122.438 |
| 2122 | 109.126 |
| 2123 | 120.242 |
| 2124 | 118.666 |
| 2125 | 81.188 |
| 2126 | 115.92 |
| 2127 | 119.006 |
| 2128 | 114.336 |
| 2129 | 114.174 |
| 2130 | 83.543 |
| 2131 | 114.567 |
| 2132 | 108.904 |
| 2133 | 137.832 |
| 2134 | 100.218 |
| 2135 | 126.797 |
| 2136 | 131.008 |
| 2137 | 95.258 |
| 2138 | 119.791 |
| 2139 | 105.458 |
| 2140 | 102.168 |
| 2141 | 130.463 |
| 2142 | 128.349 |
| 2143 | 115.417 |
| 2144 | 89.435 |
| 2145 | 98.94 |
| 2146 | 99.795 |
| 2147 | 112.598 |
| 2148 | 115.283 |
| 2149 | 127.819 |
| 2150 | 137.467 |
| 2151 | 100.613 |
| 2152 | 119.72 |
| 2153 | 113.341 |
| 2154 | 87.094 |
| 2155 | 128.888 |
| 2156 | 117.503 |
| 2157 | 106.851 |
| 2158 | 103.391 |
| 2159 | 112.48 |
| 2160 | 105.027 |
| 2161 | 125.698 |
| 2162 | 93.004 |
| 2163 | 138.937 |
| 2164 | 92.544 |
| 2165 | 107.999 |
| 2166 | 104.331 |
| 2167 | 146.657 |
| 2168 | 120.203 |
| 2169 | 145.518 |
| 2170 | 166.432 |
| 2171 | 107.34 |
| 2172 | 83.158 |
| 2173 | 126.873 |
| 2174 | 115.889 |
| 2175 | 133.602 |
| 2176 | 111.232 |
| 2177 | 106.007 |
| 2178 | 91.925 |
| 2179 | 102.614 |
| 2180 | 104.642 |
| 2181 | 111.606 |
| 2182 | 98.106 |
| 2183 | 104.424 |
| 2184 | 107.577 |
| 2185 | 97.09 |
| 2186 | 125.336 |
| 2187 | 136.069 |
| 2188 | 74.81 |
| 2189 | 105.405 |
| 2190 | 136.594 |
| 2191 | 126.586 |
| 2192 | 140.485 |
| 2193 | 137.343 |
| 2194 | 94.096 |
| 2195 | 111.177 |
| 2196 | 123.931 |
| 2197 | 124.85 |
| 2198 | 121.056 |
| 2199 | 127.13 |
| 2200 | 90.395 |
| 2201 | 112.752 |
| 2202 | 114.332 |
| 2203 | 131.757 |
| 2204 | 150.875 |
| 2205 | 91.896 |
| 2206 | 131.514 |
| 2207 | 103.019 |
| 2208 | 112.016 |
| 2209 | 104.325 |
| 2210 | 122.196 |
| 2211 | 98.511 |
| 2212 | 138.482 |
| 2213 | 118.6 |
| 2214 | 110.828 |
| 2215 | 125.183 |
| 2216 | 157.609 |
| 2217 | 99.169 |
| 2218 | 124.213 |
| 2219 | 117.901 |
| 2220 | 128.593 |
| 2221 | 118.464 |
| 2222 | 96.915 |
| 2223 | 130.884 |
| 2224 | 87.278 |
| 2225 | 128.733 |
| 2226 | 64.161 |
| 2227 | 107.166 |
| 2228 | 107.21 |
| 2229 | 110.73 |
| 2230 | 100.444 |
| 2231 | 137.659 |
| 2232 | 139.164 |
| 2233 | 132.055 |
| 2234 | 118.668 |
| 2235 | 111.027 |
| 2236 | 118.646 |
| 2237 | 180.877 |
| 2238 | 121.469 |
| 2239 | 131.614 |
| 2240 | 133.992 |
| 2241 | 99.004 |
| 2242 | 149.666 |
| 2243 | 125.9 |
| 2244 | 105.76 |
| 2245 | 104.013 |
| 2246 | 133.926 |
| 2247 | 109.083 |
| 2248 | 118.367 |
| 2249 | 124.699 |
| 2250 | 79.076 |
| 2251 | 139.408 |
| 2252 | 124.508 |
| 2253 | 135.136 |
| 2254 | 96.786 |
| 2255 | 150.113 |
| 2256 | 118.162 |
| 2257 | 143.379 |
| 2258 | 130.34 |
| 2259 | 138.616 |
| 2260 | 124.786 |
| 2261 | 94.723 |
| 2262 | 143.583 |
| 2263 | 179.177 |
| 2264 | 122.438 |
| 2265 | 157.967 |
| 2266 | 94.601 |
| 2267 | 135.783 |
| 2268 | 124.789 |
| 2269 | 102.631 |
| 2270 | 89.169 |
| 2271 | 108.856 |
| 2272 | 90.289 |
| 2273 | 136.106 |
| 2274 | 94.627 |
| 2275 | 136.325 |
| 2276 | 110.374 |
| 2277 | 130.59 |
| 2278 | 95.682 |
| 2279 | 139.897 |
| 2280 | 119.274 |
| 2281 | 96.732 |
| 2282 | 145.133 |
| 2283 | 89.066 |
| 2284 | 154.591 |
| 2285 | 78.532 |
| 2286 | 118.65 |
| 2287 | 134.113 |
| 2288 | 120.229 |
| 2289 | 150.751 |
| 2290 | 113.711 |
| 2291 | 93.359 |
| 2292 | 130.236 |
| 2293 | 109.275 |
| 2294 | 121.67 |
| 2295 | 103.024 |
| 2296 | 111.601 |
| 2297 | 107.716 |
| 2298 | 131.748 |
| 2299 | 115.963 |
| 2300 | 127.393 |
| 2301 | 121.61 |
| 2302 | 115.79 |
| 2303 | 113.11 |
| 2304 | 121.931 |
| 2305 | 120.338 |
| 2306 | 149.885 |
| 2307 | 116.536 |
| 2308 | 111.361 |
| 2309 | 157.491 |
| 2310 | 119.471 |
| 2311 | 118.104 |
| 2312 | 98.77 |
| 2313 | 97.22 |
| 2314 | 95.758 |
| 2315 | 111.474 |
| 2316 | 117.397 |
| 2317 | 116.061 |
| 2318 | 111.631 |
| 2319 | 132.185 |
| 2320 | 106.05 |
| 2321 | 129.673 |
| 2322 | 137.853 |
| 2323 | 124.1 |
| 2324 | 124.516 |
| 2325 | 120.18 |
| 2326 | 113.41 |
| 2327 | 109.491 |
| 2328 | 128.05 |
| 2329 | 104.459 |
| 2330 | 148.454 |
| 2331 | 106.767 |
| 2332 | 142.949 |
| 2333 | 112.923 |
| 2334 | 99.214 |
| 2335 | 112.687 |
| 2336 | 125.233 |
| 2337 | 93.191 |
| 2338 | 144.912 |
| 2339 | 253.142 |
| 2340 | 214.495 |
| 2341 | 148.211 |
| 2342 | 153.869 |
| 2343 | 194.055 |
| 2344 | 163.606 |
| 2345 | 172.878 |
| 2346 | 124.682 |
| 2347 | 143.012 |
| 2348 | 95.7 |
| 2349 | 165.289 |
| 2350 | 158.097 |
| 2351 | 177.358 |
| 2352 | 148.442 |
| 2353 | 194.016 |
| 2354 | 159.113 |
| 2355 | 203.326 |
| 2356 | 180.227 |
| 2357 | 1173.163 |
| 2358 | 3660.078 |
| 2359 | 390.764 |
| 2360 | 1991.521 |
| 2361 | 438.892 |
| 2362 | 6298.39 |
| 2363 | 584.828 |
| 2364 | 719.893 |
| 2365 | 1285.829 |
| 2366 | 1677.141 |
| 2367 | 24688.518 |
| 2368 | 2328.657 |
| 2369 | 3112.448 |
| 2370 | 2806.931 |
| 2371 | 7847.295 |
| 2372 | 7155.918 |
| 2373 | 46946.317 |
| 2374 | 150650.158 |
| 2375 | 150645.501 |
| 2376 | 28109.728 |
| 2377 | 4584.788 |
| 2378 | 5969.975 |
| 2379 | 1184.722 |
| 2380 | 731.784 |
| 2381 | 156.848 |
| 2382 | 161.051 |
| 2383 | 57.792 |
| 2384 | 149.51 |
| 2385 | 122.165 |
| 2386 | 136.531 |
| 2387 | 113.46 |
| 2388 | 108.976 |
| 2389 | 125.147 |
| 2390 | 128.51 |
| 2391 | 120.727 |
| 2392 | 157.246 |
| 2393 | 103.214 |
| 2394 | 157.548 |
| 2395 | 125.741 |
| 2396 | 105.173 |
| 2397 | 130.119 |
| 2398 | 114.613 |
| 2399 | 125.525 |
| 2400 | 118.165 |
| 2401 | 112.058 |
| 2402 | 101.906 |
| 2403 | 108.365 |
| 2404 | 114.612 |
| 2405 | 126.815 |
| 2406 | 114.01 |
| 2407 | 129.251 |
| 2408 | 144.254 |
| 2409 | 439.04 |
| 2410 | 1117.892 |
| 2411 | 3502.745 |
| 2412 | 4501.091 |
| 2413 | 25830.823 |
| 2414 | 128365.116 |
| 2415 | 123541.361 |
| 2416 | 71957.154 |
| 2417 | 4831.654 |
| 2418 | 9635.232 |
| 2419 | 2769.456 |
| 2420 | 5221.947 |
| 2421 | 1625.904 |
| 2422 | 15281.615 |
| 2423 | 1460.567 |
| 2424 | 1073.416 |
| 2425 | 735.915 |
| 2426 | 573.264 |
| 2427 | 7426.959 |
| 2428 | 550.257 |
| 2429 | 2065.24 |
| 2430 | 332.122 |
| 2431 | 4432.146 |
| 2432 | 1300.763 |
| 2433 | 149.481 |
| 2434 | 257.594 |
| 2435 | 142.29 |
| 2436 | 183.505 |
| 2437 | 140.09 |
| 2438 | 147.015 |
| 2439 | 127.227 |
| 2440 | 109.105 |
| 2441 | 111.316 |
| 2442 | 110.433 |
| 2443 | 130.601 |
| 2444 | 111.173 |
| 2445 | 115.2 |
| 2446 | 130.882 |
| 2447 | 122.721 |
| 2448 | 142.539 |
| 2449 | 127.959 |
| 2450 | 121.212 |
| 2451 | 84.934 |
| 2452 | 113.039 |
| 2453 | 89.696 |
| 2454 | 102.038 |
| 2455 | 95.758 |
| 2456 | 117.509 |
| 2457 | 90.699 |
| 2458 | 111.735 |
| 2459 | 152.095 |
| 2460 | 97.045 |
| 2461 | 143.993 |
| 2462 | 136.381 |
| 2463 | 116.955 |
| 2464 | 111.023 |
| 2465 | 143.265 |
| 2466 | 116.846 |
| 2467 | 74.125 |
| 2468 | 119.281 |
| 2469 | 121.537 |
| 2470 | 102.362 |
| 2471 | 103.58 |
| 2472 | 129.51 |
| 2473 | 98.221 |
| 2474 | 132.976 |
| 2475 | 113.21 |
| 2476 | 112.302 |
| 2477 | 117.37 |
| 2478 | 163.55 |
| 2479 | 133.298 |
| 2480 | 144.911 |
| 2481 | 105.778 |
| 2482 | 116.153 |
| 2483 | 117.026 |
| 2484 | 128.782 |
| 2485 | 110.398 |
| 2486 | 118.714 |
| 2487 | 116.865 |
| 2488 | 134.713 |
| 2489 | 134.462 |
| 2490 | 158.23 |
| 2491 | 149.065 |
| 2492 | 265.819 |
| 2493 | 128.034 |
| 2494 | 125.188 |
| 2495 | 113.744 |
| 2496 | 126.957 |
| 2497 | 127.191 |
| 2498 | 124.308 |
| 2499 | 100.64 |
| 2500 | 114.33 |
| 2501 | 106.398 |
| 2502 | 96.375 |
| 2503 | 115.924 |
| 2504 | 136.366 |
| 2505 | 123.185 |
| 2506 | 115.294 |
| 2507 | 117.654 |
| 2508 | 138.422 |
| 2509 | 139.749 |
| 2510 | 132.087 |
| 2511 | 120.702 |
| 2512 | 119.432 |
| 2513 | 107.692 |
| 2514 | 104.274 |
| 2515 | 134.758 |
| 2516 | 112.196 |
| 2517 | 109.501 |
| 2518 | 98.045 |
| 2519 | 107.616 |
| 2520 | 128.812 |
| 2521 | 90.719 |
| 2522 | 146.839 |
| 2523 | 141.098 |
| 2524 | 148.278 |
| 2525 | 120.605 |
| 2526 | 82.582 |
| 2527 | 80.129 |
| 2528 | 134.475 |
| 2529 | 130.252 |
| 2530 | 128.366 |
| 2531 | 112.047 |
| 2532 | 122.374 |
| 2533 | 109.814 |
| 2534 | 126.407 |
| 2535 | 117.178 |
| 2536 | 133.635 |
| 2537 | 109.203 |
| 2538 | 122.761 |
| 2539 | 134.576 |
| 2540 | 106.582 |
| 2541 | 90.859 |
| 2542 | 122.466 |
| 2543 | 113.478 |
| 2544 | 125.575 |
| 2545 | 143.862 |
| 2546 | 128.404 |
| 2547 | 138 |
| 2548 | 93.515 |
| 2549 | 102.336 |
| 2550 | 117.124 |
| 2551 | 121.284 |
| 2552 | 103.189 |
| 2553 | 130.369 |
| 2554 | 120.401 |
| 2555 | 127.766 |
| 2556 | 127.992 |
| 2557 | 117.529 |
| 2558 | 123.247 |
| 2559 | 119.422 |
| 2560 | 107.598 |
| 2561 | 118.45 |
| 2562 | 116.543 |
| 2563 | 144.167 |
| 2564 | 148.838 |
| 2565 | 126.712 |
| 2566 | 151.058 |
| 2567 | 108.085 |
| 2568 | 89.863 |
| 2569 | 107.637 |
| 2570 | 88.293 |
| 2571 | 115.862 |
| 2572 | 113.317 |
| 2573 | 118.411 |
| 2574 | 160.166 |
| 2575 | 105.638 |
| 2576 | 142.633 |
| 2577 | 148.501 |
| 2578 | 81.746 |
| 2579 | 107.891 |
| 2580 | 125.332 |
| 2581 | 119.58 |
| 2582 | 116.225 |
| 2583 | 110.872 |
| 2584 | 99.435 |
| 2585 | 129.534 |
| 2586 | 117.201 |
| 2587 | 127.432 |
| 2588 | 104.881 |
| 2589 | 118.815 |
| 2590 | 143.339 |
| 2591 | 134.611 |
| 2592 | 101.617 |
| 2593 | 108.918 |
| 2594 | 98.992 |
| 2595 | 140.822 |
| 2596 | 114.914 |
| 2597 | 107.265 |
| 2598 | 102.294 |
| 2599 | 98.085 |
| 2600 | 120.385 |
| 2601 | 98.217 |
| 2602 | 102.213 |
| 2603 | 112.029 |
| 2604 | 133.599 |
| 2605 | 88.858 |
| 2606 | 106.386 |
| 2607 | 108.762 |
| 2608 | 109.489 |
| 2609 | 139.37 |
| 2610 | 111.61 |
| 2611 | 92.67 |
| 2612 | 116.69 |
| 2613 | 106.416 |
| 2614 | 121.372 |
| 2615 | 109.2 |
| 2616 | 93.693 |
| 2617 | 109.169 |
| 2618 | 130.469 |
| 2619 | 102.067 |
| 2620 | 115.355 |
| 2621 | 130.211 |
| 2622 | 98.786 |
| 2623 | 109.782 |
| 2624 | 114.99 |
| 2625 | 103.199 |
| 2626 | 110.798 |
| 2627 | 114.748 |
| 2628 | 106.015 |
| 2629 | 107.694 |
| 2630 | 112.879 |
| 2631 | 107.136 |
| 2632 | 110.784 |
| 2633 | 116.324 |
| 2634 | 117.788 |
| 2635 | 122.845 |
| 2636 | 101.256 |
| 2637 | 106.824 |
| 2638 | 105.461 |
| 2639 | 113.256 |
| 2640 | 103.148 |
| 2641 | 97.541 |
| 2642 | 117.06 |
| 2643 | 108.456 |
| 2644 | 124.675 |
| 2645 | 110.952 |
| 2646 | 110.678 |
| 2647 | 106.589 |
| 2648 | 130.201 |
| 2649 | 110.666 |
| 2650 | 109.944 |
| 2651 | 104.198 |
| 2652 | 115.244 |
| 2653 | 98.308 |
| 2654 | 121.423 |
| 2655 | 160.348 |
| 2656 | 100.018 |
| 2657 | 93.02 |
| 2658 | 131.087 |
| 2659 | 130.439 |
| 2660 | 117.556 |
| 2661 | 94.423 |
| 2662 | 112.736 |
| 2663 | 102.483 |
| 2664 | 111.929 |
| 2665 | 103.87 |
| 2666 | 103.97 |
| 2667 | 97.281 |
| 2668 | 101.373 |
| 2669 | 106.492 |
| 2670 | 112.756 |
| 2671 | 111.832 |
| 2672 | 110.86 |
| 2673 | 109.796 |
| 2674 | 119.434 |
| 2675 | 132.832 |
| 2676 | 102.587 |
| 2677 | 109.07 |
| 2678 | 106.137 |
| 2679 | 86.527 |
| 2680 | 105.202 |
| 2681 | 108.63 |
| 2682 | 89.55 |
| 2683 | 77.29 |
| 2684 | 157.364 |
| 2685 | 119.523 |
| 2686 | 203.867 |
| 2687 | 204.716 |
| 2688 | 68.984 |
| 2689 | 95.686 |
| 2690 | 99.291 |
| 2691 | 134.376 |
| 2692 | 100.197 |
| 2693 | 78.487 |
| 2694 | 126.65 |
| 2695 | 104.245 |
| 2696 | 121.664 |
| 2697 | 82.797 |
| 2698 | 118 |
| 2699 | 98.328 |
| 2700 | 109.153 |
| 2701 | 120.428 |
| 2702 | 122.369 |
| 2703 | 102.947 |
| 2704 | 123.698 |
| 2705 | 103.548 |
| 2706 | 113.826 |
| 2707 | 127.653 |
| 2708 | 128.759 |
| 2709 | 136.443 |
| 2710 | 149.11 |
| 2711 | 90.72 |
| 2712 | 110.81 |
| 2713 | 114.251 |
| 2714 | 125.249 |
| 2715 | 94.179 |
| 2716 | 96.271 |
| 2717 | 123.145 |
| 2718 | 140.952 |
| 2719 | 89.939 |
| 2720 | 151.481 |
| 2721 | 91.846 |
| 2722 | 114.747 |
| 2723 | 102.767 |
| 2724 | 100.714 |
| 2725 | 111.716 |
| 2726 | 113.716 |
| 2727 | 114.536 |
| 2728 | 106.274 |
| 2729 | 119.91 |
| 2730 | 124.723 |
| 2731 | 104.643 |
| 2732 | 169.926 |
| 2733 | 96.67 |
| 2734 | 184.492 |
| 2735 | 117.073 |
| 2736 | 434.316 |
| 2737 | 468.41 |
| 2738 | 248.18 |
| 2739 | 489.652 |
| 2740 | 224.678 |
| 2741 | 275.707 |
| 2742 | 171.762 |
| 2743 | 322.596 |
| 2744 | 252.043 |
| 2745 | 218.995 |
| 2746 | 176.685 |
| 2747 | 125.6 |
| 2748 | 95.169 |
| 2749 | 99.651 |
| 2750 | 110.104 |
| 2751 | 132.061 |
| 2752 | 138.912 |
| 2753 | 119.805 |
| 2754 | 198.64 |
| 2755 | 124.587 |
| 2756 | 289.337 |
| 2757 | 123.482 |
| 2758 | 275.087 |
| 2759 | 668.787 |
| 2760 | 165.992 |
| 2761 | 314.204 |
| 2762 | 309.937 |
| 2763 | 311.287 |
| 2764 | 291.657 |
| 2765 | 306.457 |
| 2766 | 668.864 |
| 2767 | 275.024 |
| 2768 | 448.569 |
| 2769 | 1081.333 |
| 2770 | 169.784 |
| 2771 | 234.474 |
| 2772 | 131.25 |
| 2773 | 204.15 |
| 2774 | 113.021 |
| 2775 | 220.378 |
| 2776 | 207.356 |
| 2777 | 219.818 |
| 2778 | 275.676 |
| 2779 | 228.198 |
| 2780 | 282.599 |
| 2781 | 185.079 |
| 2782 | 724.194 |
| 2783 | 690.292 |
| 2784 | 478.763 |
| 2785 | 6944.28 |
| 2786 | 1324.188 |
| 2787 | 432.081 |
| 2788 | 1244.691 |
| 2789 | 544.994 |
| 2790 | 2847.442 |
| 2791 | 17859.958 |
| 2792 | 45291.77 |
| 2793 | 15431.694 |
| 2794 | 2720.267 |
| 2795 | 7314.263 |
| 2796 | 464125.814 |
| 2797 | 3218533.331 |
| 2798 | 3980459.583 |
| 2799 | 7195740.321 |
| 2800 | 7460969.603 |
| 2801 | 4999536.164 |
| 2802 | 5715699.778 |
| 2803 | 5984520.922 |
| 2804 | 2863743.62 |
| 2805 | 294008.726 |
| 2806 | 1284083.167 |
| 2807 | 2756466.876 |
| 2808 | 5819667.066 |
| 2809 | 6181429.209 |
| 2810 | 3061164.216 |
| 2811 | 2617368.53 |
| 2812 | 277123.565 |
| 2813 | 305609.324 |
| 2814 | 109332.858 |
| 2815 | 148850.126 |
| 2816 | 78051.068 |
| 2817 | 100654.701 |
| 2818 | 291375.858 |
| 2819 | 240165.867 |
| 2820 | 253037.187 |
| 2821 | 180217.529 |
| 2822 | 179726.901 |
| 2823 | 893602.334 |
| 2824 | 1886371.812 |
| 2825 | 1636723.059 |
| 2826 | 2781580.958 |
| 2827 | 2117940.02 |
| 2828 | 1960653.6 |
| 2829 | 1807533.564 |
| 2830 | 142487.819 |
| 2831 | 127430.628 |
| 2832 | 455721.245 |
| 2833 | 776841.322 |
| 2834 | 59019.953 |
| 2835 | 63875.25 |
| 2836 | 40029.894 |
| 2837 | 60107.163 |
| 2838 | 519445.899 |
| 2839 | 317149.979 |
| 2840 | 462516.203 |
| 2841 | 597849.768 |
| 2842 | 729703.3 |
| 2843 | 967455.942 |
| 2844 | 814542.913 |
| 2845 | 1113205.234 |
| 2846 | 1089464.39 |
| 2847 | 839656.598 |
| 2848 | 648112.354 |
| 2849 | 539249.049 |
| 2850 | 63985.249 |
| 2851 | 44948.498 |
| 2852 | 64124.674 |
| 2853 | 68451.685 |
| 2854 | 918222.993 |
| 2855 | 536806.667 |
| 2856 | 98035.248 |
| 2857 | 173069.825 |
| 2858 | 1660911.842 |
| 2859 | 2102254.992 |
| 2860 | 3294952.554 |
| 2861 | 2410981.186 |
| 2862 | 2145353.997 |
| 2863 | 2541518.553 |
| 2864 | 1323672.449 |
| 2865 | 323095.962 |
| 2866 | 291669.795 |
| 2867 | 256845.969 |
| 2868 | 407159.899 |
| 2869 | 351850.651 |
| 2870 | 422583.067 |
| 2871 | 112600.811 |
| 2872 | 87846.192 |
| 2873 | 138616.731 |
| 2874 | 117389.603 |
| 2875 | 240344.319 |
| 2876 | 331622.881 |
| 2877 | 2790114.403 |
| 2878 | 3819467.336 |
| 2879 | 7455929.279 |
| 2880 | 7415844.197 |
| 2881 | 3945679.989 |
| 2882 | 304416.491 |
| 2883 | 296642.999 |
| 2884 | 64161.148 |
| 2885 | 1617915.006 |
| 2886 | 239497.768 |
| 2887 | 2838491.177 |
| 2888 | 7776480.714 |
| 2889 | 6090675.994 |
| 2890 | 6278381.289 |
| 2891 | 7511830.41 |
| 2892 | 7184872.43 |
| 2893 | 4300894.171 |
| 2894 | 2794233.936 |
| 2895 | 181575.992 |
| 2896 | 7011.736 |
| 2897 | 2089.227 |
| 2898 | 15613.885 |
| 2899 | 14246.457 |
| 2900 | 12456.581 |
| 2901 | 3252.461 |
| 2902 | 916.489 |
| 2903 | 933.145 |
| 2904 | 805.417 |
| 2905 | 1333.674 |
| 2906 | 5909.785 |
| 2907 | 973.21 |
| 2908 | 389.854 |
| 2909 | 1001.019 |
| 2910 | 214.452 |
| 2911 | 321.928 |
| 2912 | 181.19 |
| 2913 | 240.914 |
| 2914 | 189.348 |
| 2915 | 170.571 |
| 2916 | 186.393 |
| 2917 | 148.508 |
| 2918 | 224.324 |
| 2919 | 165.465 |
| 2920 | 254.301 |
| 2921 | 182.959 |
| 2922 | 461.593 |
| 2923 | 277.76 |
| 2924 | 256.163 |
| 2925 | 257.661 |
| 2926 | 365.306 |
| 2927 | 253.573 |
| 2928 | 200.327 |
| 2929 | 204.934 |
| 2930 | 207.24 |
| 2931 | 139.957 |
| 2932 | 154.262 |
| 2933 | 455.463 |
| 2934 | 155.881 |
| 2935 | 204.567 |
| 2936 | 129.368 |
| 2937 | 127.282 |
| 2938 | 110.62 |
| 2939 | 200.795 |
| 2940 | 130.466 |
| 2941 | 113.118 |
| 2942 | 103.184 |
| 2943 | 102.368 |
| 2944 | 96.873 |
| 2945 | 92.636 |
| 2946 | 94.58 |
| 2947 | 391.389 |
| 2948 | 168.112 |
| 2949 | 249.967 |
| 2950 | 264.967 |
| 2951 | 167.702 |
| 2952 | 145.908 |
| 2953 | 329.743 |
| 2954 | 359.27 |
| 2955 | 240.353 |
| 2956 | 516.553 |
| 2957 | 147.49 |
| 2958 | 174.552 |
| 2959 | 114.087 |
| 2960 | 124.134 |
| 2961 | 122.238 |
| 2962 | 112.077 |
| 2963 | 124.047 |
| 2964 | 95.015 |
| 2965 | 99.774 |
| 2966 | 81.615 |
| 2967 | 81.909 |
| 2968 | 97.764 |
| 2969 | 147.708 |
| 2970 | 124.361 |
| 2971 | 124.708 |
| 2972 | 111.288 |
| 2973 | 103.9 |
| 2974 | 117.496 |
| 2975 | 108.257 |
| 2976 | 117.139 |
| 2977 | 128.095 |
| 2978 | 105.308 |
| 2979 | 96.325 |
| 2980 | 89.315 |
| 2981 | 127.871 |
| 2982 | 131.532 |
| 2983 | 131.49 |
| 2984 | 95.331 |
| 2985 | 155.239 |
| 2986 | 135.509 |
| 2987 | 107.371 |
| 2988 | 155.92 |
| 2989 | 157.518 |
| 2990 | 142.341 |
| 2991 | 71.672 |
| 2992 | 132.249 |
| 2993 | 146.765 |
| 2994 | 122.871 |
| 2995 | 116.287 |
| 2996 | 124.965 |
| 2997 | 86.237 |
| 2998 | 137.186 |
| 2999 | 111.532 |
| 3000 | 160.308 |
| 3001 | 125.154 |
| 3002 | 161.551 |
| 3003 | 122.957 |
| 3004 | 78.272 |
| 3005 | 117.741 |
| 3006 | 90.736 |
| 3007 | 115.749 |
| 3008 | 110.832 |
| 3009 | 145.883 |
| 3010 | 142.915 |
| 3011 | 110.889 |
| 3012 | 122.582 |
| 3013 | 132.341 |
| 3014 | 137.848 |
| 3015 | 111.098 |
| 3016 | 101.15 |
| 3017 | 100.418 |
| 3018 | 140.011 |
| 3019 | 94.027 |
| 3020 | 106.695 |
| 3021 | 115.434 |
| 3022 | 88.57 |
| 3023 | 105.633 |
| 3024 | 124.452 |
| 3025 | 93.604 |
| 3026 | 132.44 |
| 3027 | 125.122 |
| 3028 | 120.85 |
| 3029 | 105.802 |
| 3030 | 122.05 |
| 3031 | 116.908 |
| 3032 | 104.236 |
| 3033 | 98.578 |
| 3034 | 113.133 |
| 3035 | 121.689 |
| 3036 | 114.708 |
| 3037 | 113.615 |
| 3038 | 105.75 |
| 3039 | 109.289 |
| 3040 | 134.414 |
| 3041 | 143.499 |
| 3042 | 112.897 |
| 3043 | 132.24 |
| 3044 | 133.788 |
| 3045 | 138.354 |
| 3046 | 107.726 |
| 3047 | 112.556 |
| 3048 | 115.551 |
| 3049 | 121.872 |
| 3050 | 132.072 |
| 3051 | 123.334 |
| 3052 | 131.546 |
| 3053 | 95.81 |
| 3054 | 108.003 |
| 3055 | 115.095 |
| 3056 | 152.306 |
| 3057 | 92.497 |
| 3058 | 135.431 |
| 3059 | 129.198 |
| 3060 | 99.796 |
| 3061 | 117.265 |
| 3062 | 143.851 |
| 3063 | 116.07 |
| 3064 | 156.89 |
| 3065 | 94.225 |
| 3066 | 141.782 |
| 3067 | 117.898 |
| 3068 | 160.219 |
| 3069 | 140.279 |
| 3070 | 129.196 |
| 3071 | 141.64 |
| 3072 | 136.69 |
| 3073 | 120.264 |
| 3074 | 96.57 |
| 3075 | 97.599 |
| 3076 | 112.34 |
| 3077 | 119.285 |
| 3078 | 86.9 |
| 3079 | 129.376 |
| 3080 | 154.131 |
| 3081 | 100.679 |
| 3082 | 99.737 |
| 3083 | 122.848 |
| 3084 | 87.819 |
| 3085 | 165.563 |
| 3086 | 102.063 |
| 3087 | 68.52 |
| 3088 | 119.598 |
| 3089 | 121.555 |
| 3090 | 81.627 |
| 3091 | 117.68 |
| 3092 | 144.013 |
| 3093 | 123.653 |
| 3094 | 147.508 |
| 3095 | 137.055 |
| 3096 | 114.86 |
| 3097 | 103.225 |
| 3098 | 115.949 |
| 3099 | 91.875 |
| 3100 | 104.998 |
| 3101 | 164.652 |
| 3102 | 136.289 |
| 3103 | 180.947 |
| 3104 | 139.852 |
| 3105 | 138.167 |
| 3106 | 155.801 |
| 3107 | 129.203 |
| 3108 | 98.745 |
| 3109 | 149.715 |
| 3110 | 120.309 |
| 3111 | 110.865 |
| 3112 | 121.475 |
| 3113 | 140.64 |
| 3114 | 123.532 |
| 3115 | 86.54 |
| 3116 | 135.885 |
| 3117 | 138.914 |
| 3118 | 133.578 |
| 3119 | 122.549 |
| 3120 | 103.106 |
| 3121 | 104.28 |
| 3122 | 99.165 |
| 3123 | 148.466 |
| 3124 | 101.599 |
| 3125 | 131.686 |
| 3126 | 139.631 |
| 3127 | 223.771 |
| 3128 | 77.154 |
| 3129 | 112.227 |
| 3130 | 129.922 |
| 3131 | 132.174 |
| 3132 | 115.909 |
| 3133 | 128.348 |
| 3134 | 136.6 |
| 3135 | 139.431 |
| 3136 | 100.805 |
| 3137 | 193.58 |
| 3138 | 129.973 |
| 3139 | 113.411 |
| 3140 | 72.853 |
| 3141 | 92.925 |
| 3142 | 108.425 |
| 3143 | 99.882 |
| 3144 | 109.462 |
| 3145 | 147.861 |
| 3146 | 106.618 |
| 3147 | 115.947 |
| 3148 | 61.303 |
| 3149 | 117.941 |
| 3150 | 117.496 |
| 3151 | 92.602 |
| 3152 | 126.917 |
| 3153 | 119.526 |
| 3154 | 131.687 |
| 3155 | 126.374 |
| 3156 | 130.611 |
| 3157 | 101.493 |
| 3158 | 190.951 |
| 3159 | 109.83 |
| 3160 | 119.488 |
| 3161 | 95.109 |
| 3162 | 100.867 |
| 3163 | 121.857 |
| 3164 | 145.816 |
| 3165 | 108.972 |
| 3166 | 118.258 |
| 3167 | 105.59 |
| 3168 | 124.083 |
| 3169 | 115.904 |
| 3170 | 134.113 |
| 3171 | 111.005 |
| 3172 | 121.439 |
| 3173 | 114.816 |
| 3174 | 101.351 |
| 3175 | 117.922 |
| 3176 | 106.591 |
| 3177 | 110.653 |
| 3178 | 109.656 |
| 3179 | 111.474 |
| 3180 | 104.597 |
| 3181 | 82.738 |
| 3182 | 111.793 |
| 3183 | 110.838 |
| 3184 | 108.563 |
| 3185 | 141.969 |
| 3186 | 98.179 |
| 3187 | 133.02 |
| 3188 | 108.035 |
| 3189 | 113.444 |
| 3190 | 87.75 |
| 3191 | 142.131 |
| 3192 | 179.23 |
| 3193 | 134.563 |
| 3194 | 144.18 |
| 3195 | 106.277 |
| 3196 | 112.015 |
| 3197 | 95.759 |
| 3198 | 112.676 |
| 3199 | 105.844 |
| 3200 | 126.183 |
| 3201 | 98.246 |
| 3202 | 125.806 |
| 3203 | 127.608 |
| 3204 | 117.383 |
| 3205 | 139.503 |
| 3206 | 177.259 |
| 3207 | 108.031 |
| 3208 | 121.673 |
| 3209 | 115.461 |
| 3210 | 117.866 |
| 3211 | 124.855 |
| 3212 | 100.699 |
| 3213 | 99.776 |
| 3214 | 150.211 |
| 3215 | 77.336 |
| 3216 | 143.975 |
| 3217 | 124.17 |
| 3218 | 129.834 |
| 3219 | 147.442 |
| 3220 | 108.547 |
| 3221 | 126.819 |
| 3222 | 101.833 |
| 3223 | 110.948 |
| 3224 | 102.489 |
| 3225 | 89.811 |
| 3226 | 116.332 |
| 3227 | 147.295 |
| 3228 | 116.188 |
| 3229 | 130.769 |
| 3230 | 123.595 |
| 3231 | 103.29 |
| 3232 | 117.676 |
| 3233 | 110.611 |
| 3234 | 127.053 |
| 3235 | 83.703 |
| 3236 | 94.928 |
| 3237 | 124 |
| 3238 | 112.87 |
| 3239 | 141.475 |
| 3240 | 89.219 |
| 3241 | 104.585 |
| 3242 | 110.619 |
| 3243 | 125.367 |
| 3244 | 94.455 |
| 3245 | 145.783 |
| 3246 | 100.286 |
| 3247 | 207.713 |
| 3248 | 117.147 |
| 3249 | 332.686 |
| 3250 | 123.31 |
| 3251 | 734.332 |
| 3252 | 176.528 |
| 3253 | 438.738 |
| 3254 | 158.931 |
| 3255 | 694.125 |
| 3256 | 147.338 |
| 3257 | 858.692 |
| 3258 | 195.951 |
| 3259 | 822.069 |
| 3260 | 260.753 |
| 3261 | 1251.959 |
| 3262 | 156.251 |
| 3263 | 152.705 |
| 3264 | 138.916 |
| 3265 | 140.263 |
| 3266 | 194.2 |
| 3267 | 216.161 |
| 3268 | 159.397 |
| 3269 | 139.162 |
| 3270 | 105.549 |
| 3271 | 180.241 |
| 3272 | 113.631 |
| 3273 | 193.643 |
| 3274 | 210.385 |
| 3275 | 278.046 |
| 3276 | 233.006 |
| 3277 | 394.003 |
| 3278 | 399.591 |
| 3279 | 3516.531 |
| 3280 | 2638.296 |
| 3281 | 5660.333 |
| 3282 | 7425.892 |
| 3283 | 3264.211 |
| 3284 | 334.87 |
| 3285 | 535.291 |
| 3286 | 229.016 |
| 3287 | 1936.192 |
| 3288 | 1400.6 |
| 3289 | 2502.842 |
| 3290 | 443.048 |
| 3291 | 482.7 |
| 3292 | 1108.804 |
| 3293 | 2776.088 |
| 3294 | 928.001 |
| 3295 | 60857.967 |
| 3296 | 156878.034 |
| 3297 | 26286.89 |
| 3298 | 14425.326 |
| 3299 | 10327.562 |
| 3300 | 15456.073 |
| 3301 | 1173.585 |
| 3302 | 915.195 |
| 3303 | 984.528 |
| 3304 | 6683.547 |
| 3305 | 1369.348 |
| 3306 | 1435.846 |
| 3307 | 1271.703 |
| 3308 | 1662.198 |
| 3309 | 1595.781 |
| 3310 | 2670.077 |
| 3311 | 3621.221 |
| 3312 | 12745.622 |
| 3313 | 6603.517 |
| 3314 | 6904.451 |
| 3315 | 11197.394 |
| 3316 | 82373.548 |
| 3317 | 561287.731 |
| 3318 | 402176.984 |
| 3319 | 135759.979 |
| 3320 | 11657.008 |
| 3321 | 5702.265 |
| 3322 | 4483.415 |
| 3323 | 10996.943 |
| 3324 | 3566.479 |
| 3325 | 2125.722 |
| 3326 | 1242.336 |
| 3327 | 1222.774 |
| 3328 | 1188.464 |
| 3329 | 1125.69 |
| 3330 | 1258.457 |
| 3331 | 4751.986 |
| 3332 | 774.353 |
| 3333 | 702.485 |
| 3334 | 1318.872 |
| 3335 | 5208.439 |
| 3336 | 8112.509 |
| 3337 | 64921.166 |
| 3338 | 24618.67 |
| 3339 | 19594.329 |
| 3340 | 4685.33 |
| 3341 | 165946.786 |
| 3342 | 56681.012 |
| 3343 | 980.133 |
| 3344 | 2565.217 |
| 3345 | 1005.031 |
| 3346 | 483.31 |
| 3347 | 356.362 |
| 3348 | 3317.133 |
| 3349 | 1830.828 |
| 3350 | 888.078 |
| 3351 | 701.122 |
| 3352 | 890.94 |
| 3353 | 108.662 |
| 3354 | 426.457 |
| 3355 | 149.503 |
| 3356 | 4039.968 |
| 3357 | 786.271 |
| 3358 | 149.291 |
| 3359 | 150.036 |
| 3360 | 139.092 |
| 3361 | 175.28 |
| 3362 | 2351.503 |
| 3363 | 1322.243 |
| 3364 | 2226.158 |
| 3365 | 198.273 |
| 3366 | 290.397 |
| 3367 | 220.864 |
| 3368 | 407.048 |
| 3369 | 160.228 |
| 3370 | 278.444 |
| 3371 | 230.603 |
| 3372 | 217.71 |
| 3373 | 296.922 |
| 3374 | 199.941 |
| 3375 | 131.936 |
| 3376 | 137.065 |
| 3377 | 108.222 |
| 3378 | 135.744 |
| 3379 | 122.949 |
| 3380 | 499.676 |
| 3381 | 154.889 |
| 3382 | 1859.139 |
| 3383 | 199.457 |
| 3384 | 667.414 |
| 3385 | 162.793 |
| 3386 | 549.11 |
| 3387 | 191.057 |
| 3388 | 973.182 |
| 3389 | 219.743 |
| 3390 | 567.12 |
| 3391 | 205.972 |
| 3392 | 749.353 |
| 3393 | 94.508 |
| 3394 | 470.986 |
| 3395 | 108.701 |
| 3396 | 202.614 |
| 3397 | 125.108 |
| 3398 | 149.274 |
| 3399 | 97.68 |
| 3400 | 131.327 |
| 3401 | 85.695 |
| 3402 | 83.882 |
| 3403 | 108.492 |
| 3404 | 143.319 |
| 3405 | 132.116 |
| 3406 | 84.241 |
| 3407 | 52.982 |
| 3408 | 116.459 |
| 3409 | 101.226 |
| 3410 | 100.453 |
| 3411 | 126.08 |
| 3412 | 104.931 |
| 3413 | 116.553 |
| 3414 | 92.583 |
| 3415 | 166.022 |
| 3416 | 111.222 |
| 3417 | 102.024 |
| 3418 | 118.669 |
| 3419 | 135.468 |
| 3420 | 118.284 |
| 3421 | 112.049 |
| 3422 | 101.573 |
| 3423 | 109.738 |
| 3424 | 123.611 |
| 3425 | 282.075 |
| 3426 | 127.09 |
| 3427 | 190.152 |
| 3428 | 103.35 |
| 3429 | 93.786 |
| 3430 | 128.247 |
| 3431 | 103.716 |
| 3432 | 70.673 |
| 3433 | 73.948 |
| 3434 | 140.853 |
| 3435 | 108.769 |
| 3436 | 91.918 |
| 3437 | 121.058 |
| 3438 | 89.165 |
| 3439 | 113.764 |
| 3440 | 135.105 |
| 3441 | 123.468 |
| 3442 | 133.554 |
| 3443 | 113.858 |
| 3444 | 159.012 |
| 3445 | 147.455 |
| 3446 | 106.041 |
| 3447 | 82.488 |
| 3448 | 112.893 |
| 3449 | 109.15 |
| 3450 | 115.853 |
| 3451 | 84.558 |
| 3452 | 118.933 |
| 3453 | 124.868 |
| 3454 | 119.936 |
| 3455 | 176.263 |
| 3456 | 136.29 |
| 3457 | 51.663 |
| 3458 | 114.678 |
| 3459 | 149.713 |
| 3460 | 94.349 |
| 3461 | 80.611 |
| 3462 | 79.347 |
| 3463 | 119.461 |
| 3464 | 95.986 |
| 3465 | 137.37 |
| 3466 | 88.731 |
| 3467 | 57.564 |
| 3468 | 147.013 |
| 3469 | 96.553 |
| 3470 | 95.591 |
| 3471 | 109.423 |
| 3472 | 63.764 |
| 3473 | 170.514 |
| 3474 | 131.921 |
| 3475 | 193.203 |
| 3476 | 107.469 |
| 3477 | 136.938 |
| 3478 | 77.832 |
| 3479 | 127.6 |
| 3480 | 69.583 |
| 3481 | 126.786 |
| 3482 | 126.473 |
| 3483 | 119.306 |
| 3484 | 154.411 |
| 3485 | 100.272 |
| 3486 | 101.893 |
| 3487 | 105.077 |
| 3488 | 138.641 |
| 3489 | 104.135 |
| 3490 | 132.654 |
| 3491 | 129.555 |
| 3492 | 87.959 |
| 3493 | 112.431 |
| 3494 | 148.917 |
| 3495 | 136.131 |
| 3496 | 85.929 |
| 3497 | 149.718 |
| 3498 | 84.655 |
| 3499 | 147.547 |
| 3500 | 143.971 |
| 3501 | 112.136 |
| 3502 | 96.085 |
| 3503 | 131.615 |
| 3504 | 121.246 |
| 3505 | 140.884 |
| 3506 | 110.894 |
| 3507 | 116.868 |
| 3508 | 142.951 |
| 3509 | 106.241 |
| 3510 | 90.802 |
| 3511 | 103.616 |
| 3512 | 101.641 |
| 3513 | 151.061 |
| 3514 | 100.508 |
| 3515 | 160.882 |
| 3516 | 133.58 |
| 3517 | 102.796 |
| 3518 | 132.196 |
| 3519 | 116.696 |
| 3520 | 118.412 |
| 3521 | 98.081 |
| 3522 | 164.223 |
| 3523 | 166.059 |
| 3524 | 72.889 |
| 3525 | 85.891 |
| 3526 | 118.279 |
| 3527 | 102.873 |
| 3528 | 136.114 |
| 3529 | 108.144 |
| 3530 | 108.175 |
| 3531 | 103.545 |
| 3532 | 141.473 |
| 3533 | 156.434 |
| 3534 | 45.74 |
| 3535 | 152.215 |
| 3536 | 145.437 |
| 3537 | 117.221 |
| 3538 | 108.03 |
| 3539 | 158.757 |
| 3540 | 79.111 |
| 3541 | 104.366 |
| 3542 | 130.554 |
| 3543 | 114.223 |
| 3544 | 109.665 |
| 3545 | 56.526 |
| 3546 | 111.612 |
| 3547 | 113.022 |
| 3548 | 43.483 |
| 3549 | 103.064 |
| 3550 | 120.645 |
| 3551 | 101.985 |
| 3552 | 129.668 |
| 3553 | 118.007 |
| 3554 | 110.606 |
| 3555 | 143.626 |
| 3556 | 129.795 |
| 3557 | 117.801 |
| 3558 | 130.585 |
| 3559 | 160.062 |
| 3560 | 209.489 |
| 3561 | 88.237 |
| 3562 | 133.909 |
| 3563 | 135.157 |
| 3564 | 113.103 |
| 3565 | 111.292 |
| 3566 | 131.195 |
| 3567 | 120.354 |
| 3568 | 56.146 |
| 3569 | 120.483 |
| 3570 | 116.583 |
| 3571 | 150.824 |
| 3572 | 99.963 |
| 3573 | 109.971 |
| 3574 | 107.035 |
| 3575 | 112.492 |
| 3576 | 149.699 |
| 3577 | 118.072 |
| 3578 | 140.576 |
| 3579 | 122.305 |
| 3580 | 99.881 |
| 3581 | 117.759 |
| 3582 | 85.658 |
| 3583 | 120.9 |
| 3584 | 132.136 |
| 3585 | 125.593 |
| 3586 | 106.861 |
| 3587 | 117.01 |
| 3588 | 177.061 |
| 3589 | 94.762 |
| 3590 | 131.796 |
| 3591 | 83.502 |
| 3592 | 71.451 |
| 3593 | 94.216 |
| 3594 | 126.69 |
| 3595 | 113.588 |
| 3596 | 129.871 |
| 3597 | 109.005 |
| 3598 | 148.541 |
| 3599 | 100.065 |
| 3600 | 147.418 |
| 3601 | 138.938 |
| 3602 | 117.781 |
| 3603 | 136.431 |
| 3604 | 146.259 |
| 3605 | 120.294 |
| 3606 | 132.417 |
| 3607 | 87.155 |
| 3608 | 151.29 |
| 3609 | 132.197 |
| 3610 | 64.954 |
| 3611 | 126.148 |
| 3612 | 128.429 |
| 3613 | 133.26 |
| 3614 | 112.407 |
| 3615 | 114.549 |
| 3616 | 151.286 |
| 3617 | 127.307 |
| 3618 | 115.541 |
| 3619 | 88.08 |
| 3620 | 108.247 |
| 3621 | 92.482 |
| 3622 | 106.241 |
| 3623 | 123.361 |
| 3624 | 117.735 |
| 3625 | 93.035 |
| 3626 | 139.761 |
| 3627 | 89.182 |
| 3628 | 120.767 |
| 3629 | 121.065 |
| 3630 | 143.516 |
| 3631 | 106.096 |
| 3632 | 119.443 |
| 3633 | 121.859 |
| 3634 | 110.689 |
| 3635 | 128.715 |
| 3636 | 152.63 |
| 3637 | 104.018 |
| 3638 | 99.531 |
| 3639 | 97.86 |
| 3640 | 66.332 |
| 3641 | 121.171 |
| 3642 | 110.239 |
| 3643 | 139.261 |
| 3644 | 176.449 |
| 3645 | 174.201 |
| 3646 | 111.368 |
| 3647 | 153.521 |
| 3648 | 141.209 |
| 3649 | 106.431 |
| 3650 | 164.068 |
| 3651 | 116.799 |
| 3652 | 169.409 |
| 3653 | 257.062 |
| 3654 | 177.017 |
| 3655 | 118.521 |
| 3656 | 171.794 |
| 3657 | 153.433 |
| 3658 | 127.408 |
| 3659 | 110.227 |
| 3660 | 176.14 |
| 3661 | 67.791 |
| 3662 | 182.256 |
| 3663 | 117.77 |
| 3664 | 139.273 |
| 3665 | 131.964 |
| 3666 | 119.263 |
| 3667 | 123.477 |
| 3668 | 89.545 |
| 3669 | 58.449 |
| 3670 | 77.783 |
| 3671 | 132.186 |
| 3672 | 131.265 |
| 3673 | 99.512 |
| 3674 | 128.171 |
| 3675 | 117.881 |
| 3676 | 108.689 |
| 3677 | 73.272 |
| 3678 | 121.468 |
| 3679 | 131.873 |
| 3680 | 131.059 |
| 3681 | 125.539 |
| 3682 | 125.581 |
| 3683 | 125.622 |
| 3684 | 125.663 |
| 3685 | 125.704 |
| 3686 | 125.746 |
| 3687 | 125.787 |
| 3688 | 125.828 |
| 3689 | 125.869 |
| 3690 | 125.91 |
| 3691 | 125.952 |
| 3692 | 125.993 |
| 3693 | 126.034 |
| 3694 | 126.075 |
| 3695 | 126.116 |
| 3696 | 126.158 |
| 3697 | 126.199 |
| 3698 | 126.24 |
| 3699 | 126.281 |
| 3700 | 126.322 |
| 3701 | 126.364 |
| 3702 | 126.405 |
| 3703 | 126.446 |
| 3704 | 126.487 |
| 3705 | 126.528 |
| 3706 | 126.57 |
| 3707 | 126.611 |
| 3708 | 126.652 |
| 3709 | 126.693 |
| 3710 | 126.735 |
| 3711 | 126.776 |
| 3712 | 126.817 |
| 3713 | 126.858 |
| 3714 | 126.899 |
| 3715 | 126.941 |
| 3716 | 126.982 |
| 3717 | 127.023 |
| 3718 | 127.064 |
| 3719 | 127.105 |
| 3720 | 127.147 |
| 3721 | 127.188 |
| 3722 | 127.229 |
| 3723 | 127.27 |
| 3724 | 127.311 |
| 3725 | 127.353 |
| 3726 | 127.394 |
| 3727 | 127.435 |
| 3728 | 127.476 |
| 3729 | 127.517 |
| 3730 | 127.559 |
| 3731 | 127.6 |
| 3732 | 127.641 |
| 3733 | 127.682 |
| 3734 | 127.724 |
| 3735 | 127.765 |
| 3736 | 127.806 |
| 3737 | 127.847 |
| 3738 | 127.888 |
| 3739 | 127.93 |
| 3740 | 127.971 |
| 3741 | 128.012 |
| 3742 | 128.053 |
| 3743 | 128.094 |
| 3744 | 128.136 |
| 3745 | 128.177 |
| 3746 | 128.218 |
| 3747 | 128.259 |
| 3748 | 128.3 |
| 3749 | 128.342 |
| 3750 | 128.383 |
| 3751 | 128.424 |
| 3752 | 128.465 |
| 3753 | 128.506 |
| 3754 | 128.548 |
| 3755 | 128.589 |
| 3756 | 128.63 |
| 3757 | 128.671 |
| 3758 | 128.712 |
| 3759 | 128.754 |
| 3760 | 128.795 |
| 3761 | 128.836 |
| 3762 | 128.877 |
| 3763 | 128.919 |
| 3764 | 128.96 |
| 3765 | 129.001 |
| 3766 | 129.042 |
| 3767 | 129.083 |
| 3768 | 129.125 |
| 3769 | 129.166 |
| 3770 | 129.207 |
| 3771 | 129.248 |
| 3772 | 129.289 |
| 3773 | 129.331 |
| 3774 | 129.372 |
| 3775 | 129.413 |
| 3776 | 129.454 |
| 3777 | 129.495 |
| 3778 | 129.537 |
| 3779 | 129.578 |
| 3780 | 129.619 |
| 3781 | 129.66 |
| 3782 | 129.701 |
| 3783 | 129.743 |
| 3784 | 129.784 |
| 3785 | 129.825 |
| 3786 | 129.866 |
| 3787 | 129.908 |
| 3788 | 129.949 |
| 3789 | 129.99 |
| 3790 | 130.031 |
| 3791 | 130.072 |
| 3792 | 130.114 |
| 3793 | 130.155 |
| 3794 | 130.196 |
| 3795 | 130.237 |
| 3796 | 130.278 |
| 3797 | 130.32 |
| 3798 | 130.361 |
| 3799 | 130.402 |
| 3800 | 130.443 |
| 3801 | 130.484 |